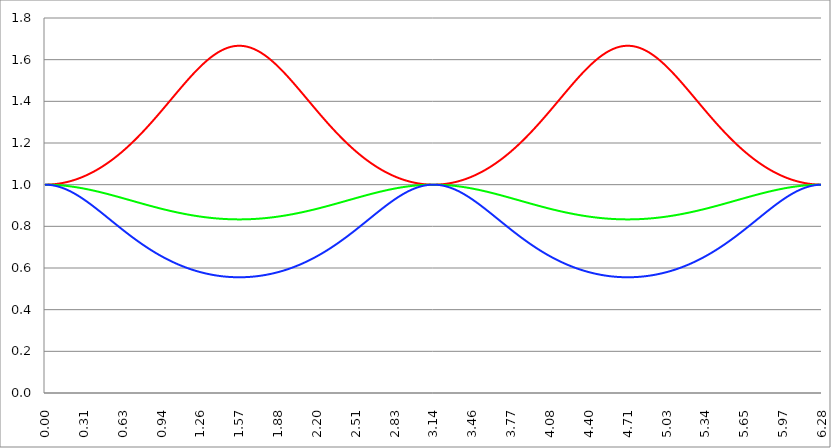
| Category | Series 1 | Series 0 | Series 2 |
|---|---|---|---|
| 0.0 | 1 | 1 | 1 |
| 0.00314159265358979 | 1 | 1 | 1 |
| 0.00628318530717958 | 1 | 1 | 1 |
| 0.00942477796076938 | 1 | 1 | 1 |
| 0.0125663706143592 | 1 | 1 | 1 |
| 0.015707963267949 | 1 | 1 | 1 |
| 0.0188495559215388 | 1 | 1 | 1 |
| 0.0219911485751285 | 1 | 1 | 1 |
| 0.0251327412287183 | 1 | 1 | 0.999 |
| 0.0282743338823081 | 1 | 1 | 0.999 |
| 0.0314159265358979 | 1 | 1 | 0.999 |
| 0.0345575191894877 | 1 | 1 | 0.999 |
| 0.0376991118430775 | 1.001 | 1 | 0.999 |
| 0.0408407044966673 | 1.001 | 1 | 0.999 |
| 0.0439822971502571 | 1.001 | 1 | 0.998 |
| 0.0471238898038469 | 1.001 | 1 | 0.998 |
| 0.0502654824574367 | 1.001 | 0.999 | 0.998 |
| 0.0534070751110265 | 1.001 | 0.999 | 0.998 |
| 0.0565486677646163 | 1.001 | 0.999 | 0.997 |
| 0.059690260418206 | 1.001 | 0.999 | 0.997 |
| 0.0628318530717958 | 1.002 | 0.999 | 0.997 |
| 0.0659734457253856 | 1.002 | 0.999 | 0.997 |
| 0.0691150383789754 | 1.002 | 0.999 | 0.996 |
| 0.0722566310325652 | 1.002 | 0.999 | 0.996 |
| 0.075398223686155 | 1.002 | 0.999 | 0.995 |
| 0.0785398163397448 | 1.002 | 0.999 | 0.995 |
| 0.0816814089933346 | 1.003 | 0.999 | 0.995 |
| 0.0848230016469244 | 1.003 | 0.999 | 0.994 |
| 0.0879645943005142 | 1.003 | 0.998 | 0.994 |
| 0.091106186954104 | 1.003 | 0.998 | 0.993 |
| 0.0942477796076937 | 1.004 | 0.998 | 0.993 |
| 0.0973893722612835 | 1.004 | 0.998 | 0.992 |
| 0.100530964914873 | 1.004 | 0.998 | 0.992 |
| 0.103672557568463 | 1.004 | 0.998 | 0.992 |
| 0.106814150222053 | 1.005 | 0.998 | 0.991 |
| 0.109955742875643 | 1.005 | 0.998 | 0.99 |
| 0.113097335529233 | 1.005 | 0.997 | 0.99 |
| 0.116238928182822 | 1.005 | 0.997 | 0.989 |
| 0.119380520836412 | 1.006 | 0.997 | 0.989 |
| 0.122522113490002 | 1.006 | 0.997 | 0.988 |
| 0.125663706143592 | 1.006 | 0.997 | 0.988 |
| 0.128805298797181 | 1.007 | 0.997 | 0.987 |
| 0.131946891450771 | 1.007 | 0.997 | 0.986 |
| 0.135088484104361 | 1.007 | 0.996 | 0.986 |
| 0.138230076757951 | 1.008 | 0.996 | 0.985 |
| 0.141371669411541 | 1.008 | 0.996 | 0.984 |
| 0.14451326206513 | 1.008 | 0.996 | 0.984 |
| 0.14765485471872 | 1.009 | 0.996 | 0.983 |
| 0.15079644737231 | 1.009 | 0.996 | 0.982 |
| 0.1539380400259 | 1.009 | 0.995 | 0.982 |
| 0.15707963267949 | 1.01 | 0.995 | 0.981 |
| 0.160221225333079 | 1.01 | 0.995 | 0.98 |
| 0.163362817986669 | 1.011 | 0.995 | 0.979 |
| 0.166504410640259 | 1.011 | 0.995 | 0.978 |
| 0.169646003293849 | 1.012 | 0.994 | 0.978 |
| 0.172787595947439 | 1.012 | 0.994 | 0.977 |
| 0.175929188601028 | 1.012 | 0.994 | 0.976 |
| 0.179070781254618 | 1.013 | 0.994 | 0.975 |
| 0.182212373908208 | 1.013 | 0.993 | 0.974 |
| 0.185353966561798 | 1.014 | 0.993 | 0.974 |
| 0.188495559215388 | 1.014 | 0.993 | 0.973 |
| 0.191637151868977 | 1.015 | 0.993 | 0.972 |
| 0.194778744522567 | 1.015 | 0.993 | 0.971 |
| 0.197920337176157 | 1.016 | 0.992 | 0.97 |
| 0.201061929829747 | 1.016 | 0.992 | 0.969 |
| 0.204203522483336 | 1.017 | 0.992 | 0.968 |
| 0.207345115136926 | 1.017 | 0.992 | 0.967 |
| 0.210486707790516 | 1.018 | 0.991 | 0.966 |
| 0.213628300444106 | 1.018 | 0.991 | 0.965 |
| 0.216769893097696 | 1.019 | 0.991 | 0.964 |
| 0.219911485751285 | 1.019 | 0.991 | 0.963 |
| 0.223053078404875 | 1.02 | 0.99 | 0.962 |
| 0.226194671058465 | 1.021 | 0.99 | 0.961 |
| 0.229336263712055 | 1.021 | 0.99 | 0.96 |
| 0.232477856365645 | 1.022 | 0.989 | 0.959 |
| 0.235619449019234 | 1.022 | 0.989 | 0.958 |
| 0.238761041672824 | 1.023 | 0.989 | 0.957 |
| 0.241902634326414 | 1.023 | 0.989 | 0.956 |
| 0.245044226980004 | 1.024 | 0.988 | 0.955 |
| 0.248185819633594 | 1.025 | 0.988 | 0.954 |
| 0.251327412287183 | 1.025 | 0.988 | 0.953 |
| 0.254469004940773 | 1.026 | 0.987 | 0.952 |
| 0.257610597594363 | 1.027 | 0.987 | 0.951 |
| 0.260752190247953 | 1.027 | 0.987 | 0.95 |
| 0.263893782901543 | 1.028 | 0.987 | 0.948 |
| 0.267035375555132 | 1.029 | 0.986 | 0.947 |
| 0.270176968208722 | 1.029 | 0.986 | 0.946 |
| 0.273318560862312 | 1.03 | 0.986 | 0.945 |
| 0.276460153515902 | 1.031 | 0.985 | 0.944 |
| 0.279601746169492 | 1.031 | 0.985 | 0.943 |
| 0.282743338823082 | 1.032 | 0.985 | 0.941 |
| 0.285884931476671 | 1.033 | 0.984 | 0.94 |
| 0.289026524130261 | 1.034 | 0.984 | 0.939 |
| 0.292168116783851 | 1.034 | 0.984 | 0.938 |
| 0.295309709437441 | 1.035 | 0.983 | 0.937 |
| 0.298451302091031 | 1.036 | 0.983 | 0.935 |
| 0.30159289474462 | 1.037 | 0.983 | 0.934 |
| 0.30473448739821 | 1.037 | 0.982 | 0.933 |
| 0.3078760800518 | 1.038 | 0.982 | 0.932 |
| 0.31101767270539 | 1.039 | 0.982 | 0.93 |
| 0.31415926535898 | 1.04 | 0.981 | 0.929 |
| 0.31730085801257 | 1.041 | 0.981 | 0.928 |
| 0.320442450666159 | 1.041 | 0.981 | 0.926 |
| 0.323584043319749 | 1.042 | 0.98 | 0.925 |
| 0.326725635973339 | 1.043 | 0.98 | 0.924 |
| 0.329867228626929 | 1.044 | 0.979 | 0.923 |
| 0.333008821280519 | 1.045 | 0.979 | 0.921 |
| 0.336150413934108 | 1.046 | 0.979 | 0.92 |
| 0.339292006587698 | 1.046 | 0.978 | 0.919 |
| 0.342433599241288 | 1.047 | 0.978 | 0.917 |
| 0.345575191894878 | 1.048 | 0.978 | 0.916 |
| 0.348716784548468 | 1.049 | 0.977 | 0.915 |
| 0.351858377202058 | 1.05 | 0.977 | 0.913 |
| 0.354999969855647 | 1.051 | 0.976 | 0.912 |
| 0.358141562509237 | 1.052 | 0.976 | 0.91 |
| 0.361283155162827 | 1.053 | 0.976 | 0.909 |
| 0.364424747816417 | 1.054 | 0.975 | 0.908 |
| 0.367566340470007 | 1.054 | 0.975 | 0.906 |
| 0.370707933123597 | 1.055 | 0.974 | 0.905 |
| 0.373849525777186 | 1.056 | 0.974 | 0.904 |
| 0.376991118430776 | 1.057 | 0.974 | 0.902 |
| 0.380132711084366 | 1.058 | 0.973 | 0.901 |
| 0.383274303737956 | 1.059 | 0.973 | 0.899 |
| 0.386415896391546 | 1.06 | 0.972 | 0.898 |
| 0.389557489045135 | 1.061 | 0.972 | 0.897 |
| 0.392699081698725 | 1.062 | 0.972 | 0.895 |
| 0.395840674352315 | 1.063 | 0.971 | 0.894 |
| 0.398982267005905 | 1.064 | 0.971 | 0.892 |
| 0.402123859659495 | 1.065 | 0.97 | 0.891 |
| 0.405265452313085 | 1.066 | 0.97 | 0.889 |
| 0.408407044966674 | 1.067 | 0.969 | 0.888 |
| 0.411548637620264 | 1.068 | 0.969 | 0.887 |
| 0.414690230273854 | 1.069 | 0.969 | 0.885 |
| 0.417831822927444 | 1.071 | 0.968 | 0.884 |
| 0.420973415581034 | 1.072 | 0.968 | 0.882 |
| 0.424115008234623 | 1.073 | 0.967 | 0.881 |
| 0.427256600888213 | 1.074 | 0.967 | 0.879 |
| 0.430398193541803 | 1.075 | 0.966 | 0.878 |
| 0.433539786195393 | 1.076 | 0.966 | 0.876 |
| 0.436681378848983 | 1.077 | 0.965 | 0.875 |
| 0.439822971502573 | 1.078 | 0.965 | 0.873 |
| 0.442964564156162 | 1.079 | 0.965 | 0.872 |
| 0.446106156809752 | 1.08 | 0.964 | 0.87 |
| 0.449247749463342 | 1.082 | 0.964 | 0.869 |
| 0.452389342116932 | 1.083 | 0.963 | 0.867 |
| 0.455530934770522 | 1.084 | 0.963 | 0.866 |
| 0.458672527424111 | 1.085 | 0.962 | 0.864 |
| 0.461814120077701 | 1.086 | 0.962 | 0.863 |
| 0.464955712731291 | 1.087 | 0.961 | 0.861 |
| 0.468097305384881 | 1.089 | 0.961 | 0.86 |
| 0.471238898038471 | 1.09 | 0.96 | 0.858 |
| 0.474380490692061 | 1.091 | 0.96 | 0.857 |
| 0.47752208334565 | 1.092 | 0.959 | 0.855 |
| 0.48066367599924 | 1.094 | 0.959 | 0.854 |
| 0.48380526865283 | 1.095 | 0.959 | 0.852 |
| 0.48694686130642 | 1.096 | 0.958 | 0.851 |
| 0.49008845396001 | 1.097 | 0.958 | 0.849 |
| 0.493230046613599 | 1.099 | 0.957 | 0.848 |
| 0.496371639267189 | 1.1 | 0.957 | 0.846 |
| 0.499513231920779 | 1.101 | 0.956 | 0.845 |
| 0.502654824574369 | 1.102 | 0.956 | 0.843 |
| 0.505796417227959 | 1.104 | 0.955 | 0.842 |
| 0.508938009881549 | 1.105 | 0.955 | 0.84 |
| 0.512079602535138 | 1.106 | 0.954 | 0.839 |
| 0.515221195188728 | 1.108 | 0.954 | 0.837 |
| 0.518362787842318 | 1.109 | 0.953 | 0.836 |
| 0.521504380495908 | 1.11 | 0.953 | 0.834 |
| 0.524645973149498 | 1.112 | 0.952 | 0.833 |
| 0.527787565803087 | 1.113 | 0.952 | 0.831 |
| 0.530929158456677 | 1.114 | 0.951 | 0.83 |
| 0.534070751110267 | 1.116 | 0.951 | 0.828 |
| 0.537212343763857 | 1.117 | 0.95 | 0.827 |
| 0.540353936417447 | 1.118 | 0.95 | 0.825 |
| 0.543495529071037 | 1.12 | 0.949 | 0.824 |
| 0.546637121724626 | 1.121 | 0.949 | 0.822 |
| 0.549778714378216 | 1.123 | 0.948 | 0.821 |
| 0.552920307031806 | 1.124 | 0.948 | 0.819 |
| 0.556061899685396 | 1.125 | 0.947 | 0.818 |
| 0.559203492338986 | 1.127 | 0.947 | 0.816 |
| 0.562345084992576 | 1.128 | 0.946 | 0.815 |
| 0.565486677646165 | 1.13 | 0.946 | 0.813 |
| 0.568628270299755 | 1.131 | 0.945 | 0.812 |
| 0.571769862953345 | 1.133 | 0.945 | 0.81 |
| 0.574911455606935 | 1.134 | 0.944 | 0.809 |
| 0.578053048260525 | 1.136 | 0.944 | 0.807 |
| 0.581194640914114 | 1.137 | 0.943 | 0.806 |
| 0.584336233567704 | 1.139 | 0.943 | 0.804 |
| 0.587477826221294 | 1.14 | 0.942 | 0.803 |
| 0.590619418874884 | 1.142 | 0.942 | 0.801 |
| 0.593761011528474 | 1.143 | 0.941 | 0.8 |
| 0.596902604182064 | 1.145 | 0.941 | 0.798 |
| 0.600044196835653 | 1.146 | 0.94 | 0.797 |
| 0.603185789489243 | 1.148 | 0.94 | 0.795 |
| 0.606327382142833 | 1.149 | 0.939 | 0.794 |
| 0.609468974796423 | 1.151 | 0.938 | 0.792 |
| 0.612610567450013 | 1.152 | 0.938 | 0.791 |
| 0.615752160103602 | 1.154 | 0.937 | 0.789 |
| 0.618893752757192 | 1.156 | 0.937 | 0.788 |
| 0.622035345410782 | 1.157 | 0.936 | 0.786 |
| 0.625176938064372 | 1.159 | 0.936 | 0.785 |
| 0.628318530717962 | 1.16 | 0.935 | 0.783 |
| 0.631460123371551 | 1.162 | 0.935 | 0.782 |
| 0.634601716025141 | 1.164 | 0.934 | 0.781 |
| 0.637743308678731 | 1.165 | 0.934 | 0.779 |
| 0.640884901332321 | 1.167 | 0.933 | 0.778 |
| 0.644026493985911 | 1.168 | 0.933 | 0.776 |
| 0.647168086639501 | 1.17 | 0.932 | 0.775 |
| 0.65030967929309 | 1.172 | 0.932 | 0.773 |
| 0.65345127194668 | 1.173 | 0.931 | 0.772 |
| 0.65659286460027 | 1.175 | 0.931 | 0.77 |
| 0.65973445725386 | 1.177 | 0.93 | 0.769 |
| 0.66287604990745 | 1.179 | 0.93 | 0.767 |
| 0.666017642561039 | 1.18 | 0.929 | 0.766 |
| 0.669159235214629 | 1.182 | 0.929 | 0.765 |
| 0.672300827868219 | 1.184 | 0.928 | 0.763 |
| 0.675442420521809 | 1.185 | 0.927 | 0.762 |
| 0.678584013175399 | 1.187 | 0.927 | 0.76 |
| 0.681725605828989 | 1.189 | 0.926 | 0.759 |
| 0.684867198482578 | 1.191 | 0.926 | 0.758 |
| 0.688008791136168 | 1.192 | 0.925 | 0.756 |
| 0.691150383789758 | 1.194 | 0.925 | 0.755 |
| 0.694291976443348 | 1.196 | 0.924 | 0.753 |
| 0.697433569096938 | 1.198 | 0.924 | 0.752 |
| 0.700575161750528 | 1.199 | 0.923 | 0.75 |
| 0.703716754404117 | 1.201 | 0.923 | 0.749 |
| 0.706858347057707 | 1.203 | 0.922 | 0.748 |
| 0.709999939711297 | 1.205 | 0.922 | 0.746 |
| 0.713141532364887 | 1.207 | 0.921 | 0.745 |
| 0.716283125018477 | 1.208 | 0.921 | 0.744 |
| 0.719424717672066 | 1.21 | 0.92 | 0.742 |
| 0.722566310325656 | 1.212 | 0.92 | 0.741 |
| 0.725707902979246 | 1.214 | 0.919 | 0.739 |
| 0.728849495632836 | 1.216 | 0.919 | 0.738 |
| 0.731991088286426 | 1.218 | 0.918 | 0.737 |
| 0.735132680940016 | 1.219 | 0.917 | 0.735 |
| 0.738274273593605 | 1.221 | 0.917 | 0.734 |
| 0.741415866247195 | 1.223 | 0.916 | 0.733 |
| 0.744557458900785 | 1.225 | 0.916 | 0.731 |
| 0.747699051554375 | 1.227 | 0.915 | 0.73 |
| 0.750840644207965 | 1.229 | 0.915 | 0.729 |
| 0.753982236861554 | 1.231 | 0.914 | 0.727 |
| 0.757123829515144 | 1.233 | 0.914 | 0.726 |
| 0.760265422168734 | 1.234 | 0.913 | 0.725 |
| 0.763407014822324 | 1.236 | 0.913 | 0.723 |
| 0.766548607475914 | 1.238 | 0.912 | 0.722 |
| 0.769690200129504 | 1.24 | 0.912 | 0.721 |
| 0.772831792783093 | 1.242 | 0.911 | 0.719 |
| 0.775973385436683 | 1.244 | 0.911 | 0.718 |
| 0.779114978090273 | 1.246 | 0.91 | 0.717 |
| 0.782256570743863 | 1.248 | 0.91 | 0.716 |
| 0.785398163397453 | 1.25 | 0.909 | 0.714 |
| 0.788539756051042 | 1.252 | 0.909 | 0.713 |
| 0.791681348704632 | 1.254 | 0.908 | 0.712 |
| 0.794822941358222 | 1.256 | 0.908 | 0.71 |
| 0.797964534011812 | 1.258 | 0.907 | 0.709 |
| 0.801106126665402 | 1.26 | 0.907 | 0.708 |
| 0.804247719318992 | 1.262 | 0.906 | 0.707 |
| 0.807389311972581 | 1.264 | 0.905 | 0.705 |
| 0.810530904626171 | 1.266 | 0.905 | 0.704 |
| 0.813672497279761 | 1.268 | 0.904 | 0.703 |
| 0.816814089933351 | 1.27 | 0.904 | 0.702 |
| 0.819955682586941 | 1.272 | 0.903 | 0.7 |
| 0.823097275240531 | 1.274 | 0.903 | 0.699 |
| 0.82623886789412 | 1.276 | 0.902 | 0.698 |
| 0.82938046054771 | 1.278 | 0.902 | 0.697 |
| 0.8325220532013 | 1.28 | 0.901 | 0.696 |
| 0.83566364585489 | 1.282 | 0.901 | 0.694 |
| 0.83880523850848 | 1.284 | 0.9 | 0.693 |
| 0.841946831162069 | 1.286 | 0.9 | 0.692 |
| 0.845088423815659 | 1.288 | 0.899 | 0.691 |
| 0.848230016469249 | 1.29 | 0.899 | 0.69 |
| 0.851371609122839 | 1.293 | 0.898 | 0.688 |
| 0.854513201776429 | 1.295 | 0.898 | 0.687 |
| 0.857654794430019 | 1.297 | 0.897 | 0.686 |
| 0.860796387083608 | 1.299 | 0.897 | 0.685 |
| 0.863937979737198 | 1.301 | 0.896 | 0.684 |
| 0.867079572390788 | 1.303 | 0.896 | 0.683 |
| 0.870221165044378 | 1.305 | 0.895 | 0.681 |
| 0.873362757697968 | 1.307 | 0.895 | 0.68 |
| 0.876504350351557 | 1.309 | 0.894 | 0.679 |
| 0.879645943005147 | 1.311 | 0.894 | 0.678 |
| 0.882787535658737 | 1.314 | 0.893 | 0.677 |
| 0.885929128312327 | 1.316 | 0.893 | 0.676 |
| 0.889070720965917 | 1.318 | 0.892 | 0.675 |
| 0.892212313619507 | 1.32 | 0.892 | 0.673 |
| 0.895353906273096 | 1.322 | 0.891 | 0.672 |
| 0.898495498926686 | 1.324 | 0.891 | 0.671 |
| 0.901637091580276 | 1.326 | 0.89 | 0.67 |
| 0.904778684233866 | 1.329 | 0.89 | 0.669 |
| 0.907920276887456 | 1.331 | 0.889 | 0.668 |
| 0.911061869541045 | 1.333 | 0.889 | 0.667 |
| 0.914203462194635 | 1.335 | 0.889 | 0.666 |
| 0.917345054848225 | 1.337 | 0.888 | 0.665 |
| 0.920486647501815 | 1.339 | 0.888 | 0.664 |
| 0.923628240155405 | 1.342 | 0.887 | 0.663 |
| 0.926769832808995 | 1.344 | 0.887 | 0.662 |
| 0.929911425462584 | 1.346 | 0.886 | 0.66 |
| 0.933053018116174 | 1.348 | 0.886 | 0.659 |
| 0.936194610769764 | 1.35 | 0.885 | 0.658 |
| 0.939336203423354 | 1.352 | 0.885 | 0.657 |
| 0.942477796076944 | 1.355 | 0.884 | 0.656 |
| 0.945619388730533 | 1.357 | 0.884 | 0.655 |
| 0.948760981384123 | 1.359 | 0.883 | 0.654 |
| 0.951902574037713 | 1.361 | 0.883 | 0.653 |
| 0.955044166691303 | 1.363 | 0.882 | 0.652 |
| 0.958185759344893 | 1.366 | 0.882 | 0.651 |
| 0.961327351998483 | 1.368 | 0.881 | 0.65 |
| 0.964468944652072 | 1.37 | 0.881 | 0.649 |
| 0.967610537305662 | 1.372 | 0.881 | 0.648 |
| 0.970752129959252 | 1.374 | 0.88 | 0.647 |
| 0.973893722612842 | 1.377 | 0.88 | 0.646 |
| 0.977035315266432 | 1.379 | 0.879 | 0.645 |
| 0.980176907920022 | 1.381 | 0.879 | 0.644 |
| 0.983318500573611 | 1.383 | 0.878 | 0.643 |
| 0.986460093227201 | 1.386 | 0.878 | 0.642 |
| 0.989601685880791 | 1.388 | 0.877 | 0.641 |
| 0.992743278534381 | 1.39 | 0.877 | 0.641 |
| 0.995884871187971 | 1.392 | 0.877 | 0.64 |
| 0.99902646384156 | 1.394 | 0.876 | 0.639 |
| 1.00216805649515 | 1.397 | 0.876 | 0.638 |
| 1.00530964914874 | 1.399 | 0.875 | 0.637 |
| 1.00845124180233 | 1.401 | 0.875 | 0.636 |
| 1.01159283445592 | 1.403 | 0.874 | 0.635 |
| 1.01473442710951 | 1.406 | 0.874 | 0.634 |
| 1.017876019763099 | 1.408 | 0.873 | 0.633 |
| 1.021017612416689 | 1.41 | 0.873 | 0.632 |
| 1.02415920507028 | 1.412 | 0.873 | 0.631 |
| 1.027300797723869 | 1.414 | 0.872 | 0.63 |
| 1.030442390377459 | 1.417 | 0.872 | 0.63 |
| 1.033583983031048 | 1.419 | 0.871 | 0.629 |
| 1.036725575684638 | 1.421 | 0.871 | 0.628 |
| 1.039867168338228 | 1.423 | 0.871 | 0.627 |
| 1.043008760991818 | 1.426 | 0.87 | 0.626 |
| 1.046150353645408 | 1.428 | 0.87 | 0.625 |
| 1.049291946298998 | 1.43 | 0.869 | 0.624 |
| 1.052433538952587 | 1.432 | 0.869 | 0.624 |
| 1.055575131606177 | 1.434 | 0.868 | 0.623 |
| 1.058716724259767 | 1.437 | 0.868 | 0.622 |
| 1.061858316913357 | 1.439 | 0.868 | 0.621 |
| 1.064999909566947 | 1.441 | 0.867 | 0.62 |
| 1.068141502220536 | 1.443 | 0.867 | 0.619 |
| 1.071283094874126 | 1.446 | 0.866 | 0.619 |
| 1.074424687527716 | 1.448 | 0.866 | 0.618 |
| 1.077566280181306 | 1.45 | 0.866 | 0.617 |
| 1.080707872834896 | 1.452 | 0.865 | 0.616 |
| 1.083849465488486 | 1.454 | 0.865 | 0.615 |
| 1.086991058142075 | 1.457 | 0.865 | 0.615 |
| 1.090132650795665 | 1.459 | 0.864 | 0.614 |
| 1.093274243449255 | 1.461 | 0.864 | 0.613 |
| 1.096415836102845 | 1.463 | 0.863 | 0.612 |
| 1.099557428756435 | 1.465 | 0.863 | 0.612 |
| 1.102699021410025 | 1.468 | 0.863 | 0.611 |
| 1.105840614063614 | 1.47 | 0.862 | 0.61 |
| 1.108982206717204 | 1.472 | 0.862 | 0.609 |
| 1.112123799370794 | 1.474 | 0.861 | 0.609 |
| 1.115265392024384 | 1.476 | 0.861 | 0.608 |
| 1.118406984677974 | 1.478 | 0.861 | 0.607 |
| 1.121548577331563 | 1.481 | 0.86 | 0.606 |
| 1.124690169985153 | 1.483 | 0.86 | 0.606 |
| 1.127831762638743 | 1.485 | 0.86 | 0.605 |
| 1.130973355292333 | 1.487 | 0.859 | 0.604 |
| 1.134114947945923 | 1.489 | 0.859 | 0.604 |
| 1.137256540599513 | 1.491 | 0.859 | 0.603 |
| 1.140398133253102 | 1.493 | 0.858 | 0.602 |
| 1.143539725906692 | 1.495 | 0.858 | 0.601 |
| 1.146681318560282 | 1.498 | 0.858 | 0.601 |
| 1.149822911213872 | 1.5 | 0.857 | 0.6 |
| 1.152964503867462 | 1.502 | 0.857 | 0.599 |
| 1.156106096521051 | 1.504 | 0.857 | 0.599 |
| 1.159247689174641 | 1.506 | 0.856 | 0.598 |
| 1.162389281828231 | 1.508 | 0.856 | 0.597 |
| 1.165530874481821 | 1.51 | 0.855 | 0.597 |
| 1.168672467135411 | 1.512 | 0.855 | 0.596 |
| 1.171814059789001 | 1.514 | 0.855 | 0.595 |
| 1.17495565244259 | 1.516 | 0.855 | 0.595 |
| 1.17809724509618 | 1.518 | 0.854 | 0.594 |
| 1.18123883774977 | 1.52 | 0.854 | 0.594 |
| 1.18438043040336 | 1.523 | 0.854 | 0.593 |
| 1.18752202305695 | 1.525 | 0.853 | 0.592 |
| 1.190663615710539 | 1.527 | 0.853 | 0.592 |
| 1.193805208364129 | 1.529 | 0.853 | 0.591 |
| 1.19694680101772 | 1.531 | 0.852 | 0.591 |
| 1.200088393671309 | 1.533 | 0.852 | 0.59 |
| 1.203229986324899 | 1.535 | 0.852 | 0.589 |
| 1.206371578978489 | 1.537 | 0.851 | 0.589 |
| 1.209513171632078 | 1.539 | 0.851 | 0.588 |
| 1.212654764285668 | 1.54 | 0.851 | 0.588 |
| 1.215796356939258 | 1.542 | 0.85 | 0.587 |
| 1.218937949592848 | 1.544 | 0.85 | 0.587 |
| 1.222079542246438 | 1.546 | 0.85 | 0.586 |
| 1.225221134900027 | 1.548 | 0.85 | 0.585 |
| 1.228362727553617 | 1.55 | 0.849 | 0.585 |
| 1.231504320207207 | 1.552 | 0.849 | 0.584 |
| 1.234645912860797 | 1.554 | 0.849 | 0.584 |
| 1.237787505514387 | 1.556 | 0.848 | 0.583 |
| 1.240929098167977 | 1.558 | 0.848 | 0.583 |
| 1.244070690821566 | 1.56 | 0.848 | 0.582 |
| 1.247212283475156 | 1.561 | 0.848 | 0.582 |
| 1.250353876128746 | 1.563 | 0.847 | 0.581 |
| 1.253495468782336 | 1.565 | 0.847 | 0.581 |
| 1.256637061435926 | 1.567 | 0.847 | 0.58 |
| 1.259778654089515 | 1.569 | 0.847 | 0.58 |
| 1.262920246743105 | 1.571 | 0.846 | 0.579 |
| 1.266061839396695 | 1.572 | 0.846 | 0.579 |
| 1.269203432050285 | 1.574 | 0.846 | 0.578 |
| 1.272345024703875 | 1.576 | 0.846 | 0.578 |
| 1.275486617357465 | 1.578 | 0.845 | 0.577 |
| 1.278628210011054 | 1.579 | 0.845 | 0.577 |
| 1.281769802664644 | 1.581 | 0.845 | 0.576 |
| 1.284911395318234 | 1.583 | 0.845 | 0.576 |
| 1.288052987971824 | 1.584 | 0.844 | 0.575 |
| 1.291194580625414 | 1.586 | 0.844 | 0.575 |
| 1.294336173279003 | 1.588 | 0.844 | 0.575 |
| 1.297477765932593 | 1.589 | 0.844 | 0.574 |
| 1.300619358586183 | 1.591 | 0.843 | 0.574 |
| 1.303760951239773 | 1.593 | 0.843 | 0.573 |
| 1.306902543893363 | 1.594 | 0.843 | 0.573 |
| 1.310044136546953 | 1.596 | 0.843 | 0.572 |
| 1.313185729200542 | 1.598 | 0.842 | 0.572 |
| 1.316327321854132 | 1.599 | 0.842 | 0.572 |
| 1.319468914507722 | 1.601 | 0.842 | 0.571 |
| 1.322610507161312 | 1.602 | 0.842 | 0.571 |
| 1.325752099814902 | 1.604 | 0.842 | 0.57 |
| 1.328893692468491 | 1.605 | 0.841 | 0.57 |
| 1.332035285122081 | 1.607 | 0.841 | 0.57 |
| 1.335176877775671 | 1.608 | 0.841 | 0.569 |
| 1.338318470429261 | 1.61 | 0.841 | 0.569 |
| 1.341460063082851 | 1.611 | 0.841 | 0.569 |
| 1.344601655736441 | 1.613 | 0.84 | 0.568 |
| 1.34774324839003 | 1.614 | 0.84 | 0.568 |
| 1.35088484104362 | 1.615 | 0.84 | 0.568 |
| 1.35402643369721 | 1.617 | 0.84 | 0.567 |
| 1.3571680263508 | 1.618 | 0.84 | 0.567 |
| 1.36030961900439 | 1.62 | 0.839 | 0.567 |
| 1.363451211657979 | 1.621 | 0.839 | 0.566 |
| 1.36659280431157 | 1.622 | 0.839 | 0.566 |
| 1.369734396965159 | 1.623 | 0.839 | 0.566 |
| 1.372875989618749 | 1.625 | 0.839 | 0.565 |
| 1.376017582272339 | 1.626 | 0.839 | 0.565 |
| 1.379159174925929 | 1.627 | 0.838 | 0.565 |
| 1.382300767579518 | 1.629 | 0.838 | 0.564 |
| 1.385442360233108 | 1.63 | 0.838 | 0.564 |
| 1.388583952886698 | 1.631 | 0.838 | 0.564 |
| 1.391725545540288 | 1.632 | 0.838 | 0.564 |
| 1.394867138193878 | 1.633 | 0.838 | 0.563 |
| 1.398008730847468 | 1.634 | 0.837 | 0.563 |
| 1.401150323501057 | 1.636 | 0.837 | 0.563 |
| 1.404291916154647 | 1.637 | 0.837 | 0.562 |
| 1.407433508808237 | 1.638 | 0.837 | 0.562 |
| 1.410575101461827 | 1.639 | 0.837 | 0.562 |
| 1.413716694115417 | 1.64 | 0.837 | 0.562 |
| 1.416858286769006 | 1.641 | 0.837 | 0.561 |
| 1.419999879422596 | 1.642 | 0.836 | 0.561 |
| 1.423141472076186 | 1.643 | 0.836 | 0.561 |
| 1.426283064729776 | 1.644 | 0.836 | 0.561 |
| 1.429424657383366 | 1.645 | 0.836 | 0.561 |
| 1.432566250036956 | 1.646 | 0.836 | 0.56 |
| 1.435707842690545 | 1.647 | 0.836 | 0.56 |
| 1.438849435344135 | 1.648 | 0.836 | 0.56 |
| 1.441991027997725 | 1.649 | 0.836 | 0.56 |
| 1.445132620651315 | 1.649 | 0.836 | 0.559 |
| 1.448274213304905 | 1.65 | 0.835 | 0.559 |
| 1.451415805958494 | 1.651 | 0.835 | 0.559 |
| 1.454557398612084 | 1.652 | 0.835 | 0.559 |
| 1.457698991265674 | 1.653 | 0.835 | 0.559 |
| 1.460840583919264 | 1.653 | 0.835 | 0.559 |
| 1.463982176572854 | 1.654 | 0.835 | 0.558 |
| 1.467123769226444 | 1.655 | 0.835 | 0.558 |
| 1.470265361880033 | 1.656 | 0.835 | 0.558 |
| 1.473406954533623 | 1.656 | 0.835 | 0.558 |
| 1.476548547187213 | 1.657 | 0.835 | 0.558 |
| 1.479690139840803 | 1.658 | 0.834 | 0.558 |
| 1.482831732494393 | 1.658 | 0.834 | 0.557 |
| 1.485973325147982 | 1.659 | 0.834 | 0.557 |
| 1.489114917801572 | 1.659 | 0.834 | 0.557 |
| 1.492256510455162 | 1.66 | 0.834 | 0.557 |
| 1.495398103108752 | 1.66 | 0.834 | 0.557 |
| 1.498539695762342 | 1.661 | 0.834 | 0.557 |
| 1.501681288415932 | 1.661 | 0.834 | 0.557 |
| 1.504822881069521 | 1.662 | 0.834 | 0.557 |
| 1.507964473723111 | 1.662 | 0.834 | 0.557 |
| 1.511106066376701 | 1.663 | 0.834 | 0.556 |
| 1.514247659030291 | 1.663 | 0.834 | 0.556 |
| 1.517389251683881 | 1.664 | 0.834 | 0.556 |
| 1.520530844337471 | 1.664 | 0.834 | 0.556 |
| 1.52367243699106 | 1.664 | 0.834 | 0.556 |
| 1.52681402964465 | 1.665 | 0.834 | 0.556 |
| 1.52995562229824 | 1.665 | 0.834 | 0.556 |
| 1.53309721495183 | 1.665 | 0.834 | 0.556 |
| 1.53623880760542 | 1.665 | 0.833 | 0.556 |
| 1.539380400259009 | 1.666 | 0.833 | 0.556 |
| 1.542521992912599 | 1.666 | 0.833 | 0.556 |
| 1.545663585566189 | 1.666 | 0.833 | 0.556 |
| 1.548805178219779 | 1.666 | 0.833 | 0.556 |
| 1.551946770873369 | 1.666 | 0.833 | 0.556 |
| 1.555088363526959 | 1.666 | 0.833 | 0.556 |
| 1.558229956180548 | 1.666 | 0.833 | 0.556 |
| 1.561371548834138 | 1.667 | 0.833 | 0.556 |
| 1.564513141487728 | 1.667 | 0.833 | 0.556 |
| 1.567654734141318 | 1.667 | 0.833 | 0.556 |
| 1.570796326794908 | 1.667 | 0.833 | 0.556 |
| 1.573937919448497 | 1.667 | 0.833 | 0.556 |
| 1.577079512102087 | 1.667 | 0.833 | 0.556 |
| 1.580221104755677 | 1.667 | 0.833 | 0.556 |
| 1.583362697409267 | 1.666 | 0.833 | 0.556 |
| 1.586504290062857 | 1.666 | 0.833 | 0.556 |
| 1.589645882716447 | 1.666 | 0.833 | 0.556 |
| 1.592787475370036 | 1.666 | 0.833 | 0.556 |
| 1.595929068023626 | 1.666 | 0.833 | 0.556 |
| 1.599070660677216 | 1.666 | 0.833 | 0.556 |
| 1.602212253330806 | 1.666 | 0.833 | 0.556 |
| 1.605353845984396 | 1.665 | 0.833 | 0.556 |
| 1.608495438637985 | 1.665 | 0.834 | 0.556 |
| 1.611637031291575 | 1.665 | 0.834 | 0.556 |
| 1.614778623945165 | 1.665 | 0.834 | 0.556 |
| 1.617920216598755 | 1.664 | 0.834 | 0.556 |
| 1.621061809252345 | 1.664 | 0.834 | 0.556 |
| 1.624203401905935 | 1.664 | 0.834 | 0.556 |
| 1.627344994559524 | 1.663 | 0.834 | 0.556 |
| 1.630486587213114 | 1.663 | 0.834 | 0.556 |
| 1.633628179866704 | 1.662 | 0.834 | 0.557 |
| 1.636769772520294 | 1.662 | 0.834 | 0.557 |
| 1.639911365173884 | 1.661 | 0.834 | 0.557 |
| 1.643052957827473 | 1.661 | 0.834 | 0.557 |
| 1.646194550481063 | 1.66 | 0.834 | 0.557 |
| 1.649336143134653 | 1.66 | 0.834 | 0.557 |
| 1.652477735788243 | 1.659 | 0.834 | 0.557 |
| 1.655619328441833 | 1.659 | 0.834 | 0.557 |
| 1.658760921095423 | 1.658 | 0.834 | 0.557 |
| 1.661902513749012 | 1.658 | 0.834 | 0.558 |
| 1.665044106402602 | 1.657 | 0.835 | 0.558 |
| 1.668185699056192 | 1.656 | 0.835 | 0.558 |
| 1.671327291709782 | 1.656 | 0.835 | 0.558 |
| 1.674468884363372 | 1.655 | 0.835 | 0.558 |
| 1.677610477016961 | 1.654 | 0.835 | 0.558 |
| 1.680752069670551 | 1.653 | 0.835 | 0.559 |
| 1.683893662324141 | 1.653 | 0.835 | 0.559 |
| 1.687035254977731 | 1.652 | 0.835 | 0.559 |
| 1.690176847631321 | 1.651 | 0.835 | 0.559 |
| 1.693318440284911 | 1.65 | 0.835 | 0.559 |
| 1.6964600329385 | 1.649 | 0.836 | 0.559 |
| 1.69960162559209 | 1.649 | 0.836 | 0.56 |
| 1.70274321824568 | 1.648 | 0.836 | 0.56 |
| 1.70588481089927 | 1.647 | 0.836 | 0.56 |
| 1.70902640355286 | 1.646 | 0.836 | 0.56 |
| 1.712167996206449 | 1.645 | 0.836 | 0.561 |
| 1.715309588860039 | 1.644 | 0.836 | 0.561 |
| 1.71845118151363 | 1.643 | 0.836 | 0.561 |
| 1.721592774167219 | 1.642 | 0.836 | 0.561 |
| 1.724734366820809 | 1.641 | 0.837 | 0.561 |
| 1.727875959474399 | 1.64 | 0.837 | 0.562 |
| 1.731017552127988 | 1.639 | 0.837 | 0.562 |
| 1.734159144781578 | 1.638 | 0.837 | 0.562 |
| 1.737300737435168 | 1.637 | 0.837 | 0.562 |
| 1.740442330088758 | 1.636 | 0.837 | 0.563 |
| 1.743583922742348 | 1.634 | 0.837 | 0.563 |
| 1.746725515395937 | 1.633 | 0.838 | 0.563 |
| 1.749867108049527 | 1.632 | 0.838 | 0.564 |
| 1.753008700703117 | 1.631 | 0.838 | 0.564 |
| 1.756150293356707 | 1.63 | 0.838 | 0.564 |
| 1.759291886010297 | 1.629 | 0.838 | 0.564 |
| 1.762433478663887 | 1.627 | 0.838 | 0.565 |
| 1.765575071317476 | 1.626 | 0.839 | 0.565 |
| 1.768716663971066 | 1.625 | 0.839 | 0.565 |
| 1.771858256624656 | 1.623 | 0.839 | 0.566 |
| 1.774999849278246 | 1.622 | 0.839 | 0.566 |
| 1.778141441931836 | 1.621 | 0.839 | 0.566 |
| 1.781283034585426 | 1.62 | 0.839 | 0.567 |
| 1.784424627239015 | 1.618 | 0.84 | 0.567 |
| 1.787566219892605 | 1.617 | 0.84 | 0.567 |
| 1.790707812546195 | 1.615 | 0.84 | 0.568 |
| 1.793849405199785 | 1.614 | 0.84 | 0.568 |
| 1.796990997853375 | 1.613 | 0.84 | 0.568 |
| 1.800132590506964 | 1.611 | 0.841 | 0.569 |
| 1.803274183160554 | 1.61 | 0.841 | 0.569 |
| 1.806415775814144 | 1.608 | 0.841 | 0.569 |
| 1.809557368467734 | 1.607 | 0.841 | 0.57 |
| 1.812698961121324 | 1.605 | 0.841 | 0.57 |
| 1.815840553774914 | 1.604 | 0.842 | 0.57 |
| 1.818982146428503 | 1.602 | 0.842 | 0.571 |
| 1.822123739082093 | 1.601 | 0.842 | 0.571 |
| 1.825265331735683 | 1.599 | 0.842 | 0.572 |
| 1.828406924389273 | 1.598 | 0.842 | 0.572 |
| 1.831548517042863 | 1.596 | 0.843 | 0.572 |
| 1.834690109696452 | 1.594 | 0.843 | 0.573 |
| 1.837831702350042 | 1.593 | 0.843 | 0.573 |
| 1.840973295003632 | 1.591 | 0.843 | 0.574 |
| 1.844114887657222 | 1.589 | 0.844 | 0.574 |
| 1.847256480310812 | 1.588 | 0.844 | 0.575 |
| 1.850398072964402 | 1.586 | 0.844 | 0.575 |
| 1.853539665617991 | 1.584 | 0.844 | 0.575 |
| 1.856681258271581 | 1.583 | 0.845 | 0.576 |
| 1.859822850925171 | 1.581 | 0.845 | 0.576 |
| 1.862964443578761 | 1.579 | 0.845 | 0.577 |
| 1.866106036232351 | 1.578 | 0.845 | 0.577 |
| 1.86924762888594 | 1.576 | 0.846 | 0.578 |
| 1.87238922153953 | 1.574 | 0.846 | 0.578 |
| 1.87553081419312 | 1.572 | 0.846 | 0.579 |
| 1.87867240684671 | 1.571 | 0.846 | 0.579 |
| 1.8818139995003 | 1.569 | 0.847 | 0.58 |
| 1.88495559215389 | 1.567 | 0.847 | 0.58 |
| 1.888097184807479 | 1.565 | 0.847 | 0.581 |
| 1.891238777461069 | 1.563 | 0.847 | 0.581 |
| 1.89438037011466 | 1.561 | 0.848 | 0.582 |
| 1.897521962768249 | 1.56 | 0.848 | 0.582 |
| 1.900663555421839 | 1.558 | 0.848 | 0.583 |
| 1.903805148075429 | 1.556 | 0.848 | 0.583 |
| 1.906946740729018 | 1.554 | 0.849 | 0.584 |
| 1.910088333382608 | 1.552 | 0.849 | 0.584 |
| 1.913229926036198 | 1.55 | 0.849 | 0.585 |
| 1.916371518689788 | 1.548 | 0.85 | 0.585 |
| 1.919513111343378 | 1.546 | 0.85 | 0.586 |
| 1.922654703996967 | 1.544 | 0.85 | 0.587 |
| 1.925796296650557 | 1.542 | 0.85 | 0.587 |
| 1.928937889304147 | 1.54 | 0.851 | 0.588 |
| 1.932079481957737 | 1.539 | 0.851 | 0.588 |
| 1.935221074611327 | 1.537 | 0.851 | 0.589 |
| 1.938362667264917 | 1.535 | 0.852 | 0.589 |
| 1.941504259918506 | 1.533 | 0.852 | 0.59 |
| 1.944645852572096 | 1.531 | 0.852 | 0.591 |
| 1.947787445225686 | 1.529 | 0.853 | 0.591 |
| 1.950929037879276 | 1.527 | 0.853 | 0.592 |
| 1.954070630532866 | 1.525 | 0.853 | 0.592 |
| 1.957212223186455 | 1.523 | 0.854 | 0.593 |
| 1.960353815840045 | 1.52 | 0.854 | 0.594 |
| 1.963495408493635 | 1.518 | 0.854 | 0.594 |
| 1.966637001147225 | 1.516 | 0.855 | 0.595 |
| 1.969778593800815 | 1.514 | 0.855 | 0.595 |
| 1.972920186454405 | 1.512 | 0.855 | 0.596 |
| 1.976061779107994 | 1.51 | 0.855 | 0.597 |
| 1.979203371761584 | 1.508 | 0.856 | 0.597 |
| 1.982344964415174 | 1.506 | 0.856 | 0.598 |
| 1.985486557068764 | 1.504 | 0.857 | 0.599 |
| 1.988628149722354 | 1.502 | 0.857 | 0.599 |
| 1.991769742375943 | 1.5 | 0.857 | 0.6 |
| 1.994911335029533 | 1.498 | 0.858 | 0.601 |
| 1.998052927683123 | 1.495 | 0.858 | 0.601 |
| 2.001194520336712 | 1.493 | 0.858 | 0.602 |
| 2.004336112990302 | 1.491 | 0.859 | 0.603 |
| 2.007477705643892 | 1.489 | 0.859 | 0.604 |
| 2.010619298297482 | 1.487 | 0.859 | 0.604 |
| 2.013760890951071 | 1.485 | 0.86 | 0.605 |
| 2.016902483604661 | 1.483 | 0.86 | 0.606 |
| 2.02004407625825 | 1.481 | 0.86 | 0.606 |
| 2.02318566891184 | 1.478 | 0.861 | 0.607 |
| 2.02632726156543 | 1.476 | 0.861 | 0.608 |
| 2.029468854219019 | 1.474 | 0.861 | 0.609 |
| 2.032610446872609 | 1.472 | 0.862 | 0.609 |
| 2.035752039526198 | 1.47 | 0.862 | 0.61 |
| 2.038893632179788 | 1.468 | 0.863 | 0.611 |
| 2.042035224833378 | 1.465 | 0.863 | 0.612 |
| 2.045176817486967 | 1.463 | 0.863 | 0.612 |
| 2.048318410140557 | 1.461 | 0.864 | 0.613 |
| 2.051460002794146 | 1.459 | 0.864 | 0.614 |
| 2.054601595447736 | 1.457 | 0.865 | 0.615 |
| 2.057743188101325 | 1.454 | 0.865 | 0.615 |
| 2.060884780754915 | 1.452 | 0.865 | 0.616 |
| 2.064026373408505 | 1.45 | 0.866 | 0.617 |
| 2.067167966062094 | 1.448 | 0.866 | 0.618 |
| 2.070309558715684 | 1.446 | 0.866 | 0.619 |
| 2.073451151369273 | 1.443 | 0.867 | 0.619 |
| 2.076592744022863 | 1.441 | 0.867 | 0.62 |
| 2.079734336676452 | 1.439 | 0.868 | 0.621 |
| 2.082875929330042 | 1.437 | 0.868 | 0.622 |
| 2.086017521983632 | 1.434 | 0.868 | 0.623 |
| 2.089159114637221 | 1.432 | 0.869 | 0.624 |
| 2.092300707290811 | 1.43 | 0.869 | 0.624 |
| 2.095442299944401 | 1.428 | 0.87 | 0.625 |
| 2.09858389259799 | 1.426 | 0.87 | 0.626 |
| 2.10172548525158 | 1.423 | 0.871 | 0.627 |
| 2.104867077905169 | 1.421 | 0.871 | 0.628 |
| 2.108008670558759 | 1.419 | 0.871 | 0.629 |
| 2.111150263212349 | 1.417 | 0.872 | 0.63 |
| 2.114291855865938 | 1.414 | 0.872 | 0.63 |
| 2.117433448519528 | 1.412 | 0.873 | 0.631 |
| 2.120575041173117 | 1.41 | 0.873 | 0.632 |
| 2.123716633826707 | 1.408 | 0.873 | 0.633 |
| 2.126858226480297 | 1.406 | 0.874 | 0.634 |
| 2.129999819133886 | 1.403 | 0.874 | 0.635 |
| 2.133141411787476 | 1.401 | 0.875 | 0.636 |
| 2.136283004441065 | 1.399 | 0.875 | 0.637 |
| 2.139424597094655 | 1.397 | 0.876 | 0.638 |
| 2.142566189748245 | 1.394 | 0.876 | 0.639 |
| 2.145707782401834 | 1.392 | 0.877 | 0.64 |
| 2.148849375055424 | 1.39 | 0.877 | 0.641 |
| 2.151990967709013 | 1.388 | 0.877 | 0.641 |
| 2.155132560362603 | 1.386 | 0.878 | 0.642 |
| 2.158274153016193 | 1.383 | 0.878 | 0.643 |
| 2.161415745669782 | 1.381 | 0.879 | 0.644 |
| 2.164557338323372 | 1.379 | 0.879 | 0.645 |
| 2.167698930976961 | 1.377 | 0.88 | 0.646 |
| 2.170840523630551 | 1.374 | 0.88 | 0.647 |
| 2.173982116284141 | 1.372 | 0.881 | 0.648 |
| 2.17712370893773 | 1.37 | 0.881 | 0.649 |
| 2.18026530159132 | 1.368 | 0.881 | 0.65 |
| 2.183406894244909 | 1.366 | 0.882 | 0.651 |
| 2.186548486898499 | 1.363 | 0.882 | 0.652 |
| 2.189690079552089 | 1.361 | 0.883 | 0.653 |
| 2.192831672205678 | 1.359 | 0.883 | 0.654 |
| 2.195973264859268 | 1.357 | 0.884 | 0.655 |
| 2.199114857512857 | 1.355 | 0.884 | 0.656 |
| 2.202256450166447 | 1.352 | 0.885 | 0.657 |
| 2.205398042820036 | 1.35 | 0.885 | 0.658 |
| 2.208539635473626 | 1.348 | 0.886 | 0.659 |
| 2.211681228127216 | 1.346 | 0.886 | 0.66 |
| 2.214822820780805 | 1.344 | 0.887 | 0.662 |
| 2.217964413434395 | 1.342 | 0.887 | 0.663 |
| 2.221106006087984 | 1.339 | 0.888 | 0.664 |
| 2.224247598741574 | 1.337 | 0.888 | 0.665 |
| 2.227389191395164 | 1.335 | 0.889 | 0.666 |
| 2.230530784048753 | 1.333 | 0.889 | 0.667 |
| 2.233672376702343 | 1.331 | 0.889 | 0.668 |
| 2.236813969355933 | 1.329 | 0.89 | 0.669 |
| 2.239955562009522 | 1.326 | 0.89 | 0.67 |
| 2.243097154663112 | 1.324 | 0.891 | 0.671 |
| 2.246238747316701 | 1.322 | 0.891 | 0.672 |
| 2.249380339970291 | 1.32 | 0.892 | 0.673 |
| 2.252521932623881 | 1.318 | 0.892 | 0.675 |
| 2.25566352527747 | 1.316 | 0.893 | 0.676 |
| 2.25880511793106 | 1.314 | 0.893 | 0.677 |
| 2.261946710584649 | 1.311 | 0.894 | 0.678 |
| 2.265088303238239 | 1.309 | 0.894 | 0.679 |
| 2.268229895891829 | 1.307 | 0.895 | 0.68 |
| 2.271371488545418 | 1.305 | 0.895 | 0.681 |
| 2.274513081199008 | 1.303 | 0.896 | 0.683 |
| 2.277654673852597 | 1.301 | 0.896 | 0.684 |
| 2.280796266506186 | 1.299 | 0.897 | 0.685 |
| 2.283937859159776 | 1.297 | 0.897 | 0.686 |
| 2.287079451813366 | 1.295 | 0.898 | 0.687 |
| 2.290221044466955 | 1.293 | 0.898 | 0.688 |
| 2.293362637120545 | 1.29 | 0.899 | 0.69 |
| 2.296504229774135 | 1.288 | 0.899 | 0.691 |
| 2.299645822427724 | 1.286 | 0.9 | 0.692 |
| 2.302787415081314 | 1.284 | 0.9 | 0.693 |
| 2.305929007734904 | 1.282 | 0.901 | 0.694 |
| 2.309070600388493 | 1.28 | 0.901 | 0.696 |
| 2.312212193042083 | 1.278 | 0.902 | 0.697 |
| 2.315353785695672 | 1.276 | 0.902 | 0.698 |
| 2.318495378349262 | 1.274 | 0.903 | 0.699 |
| 2.321636971002852 | 1.272 | 0.903 | 0.7 |
| 2.324778563656441 | 1.27 | 0.904 | 0.702 |
| 2.327920156310031 | 1.268 | 0.904 | 0.703 |
| 2.33106174896362 | 1.266 | 0.905 | 0.704 |
| 2.33420334161721 | 1.264 | 0.905 | 0.705 |
| 2.3373449342708 | 1.262 | 0.906 | 0.707 |
| 2.340486526924389 | 1.26 | 0.907 | 0.708 |
| 2.343628119577979 | 1.258 | 0.907 | 0.709 |
| 2.346769712231568 | 1.256 | 0.908 | 0.71 |
| 2.349911304885158 | 1.254 | 0.908 | 0.712 |
| 2.353052897538748 | 1.252 | 0.909 | 0.713 |
| 2.356194490192337 | 1.25 | 0.909 | 0.714 |
| 2.359336082845927 | 1.248 | 0.91 | 0.716 |
| 2.362477675499516 | 1.246 | 0.91 | 0.717 |
| 2.365619268153106 | 1.244 | 0.911 | 0.718 |
| 2.368760860806696 | 1.242 | 0.911 | 0.719 |
| 2.371902453460285 | 1.24 | 0.912 | 0.721 |
| 2.375044046113875 | 1.238 | 0.912 | 0.722 |
| 2.378185638767464 | 1.236 | 0.913 | 0.723 |
| 2.381327231421054 | 1.234 | 0.913 | 0.725 |
| 2.384468824074644 | 1.233 | 0.914 | 0.726 |
| 2.387610416728233 | 1.231 | 0.914 | 0.727 |
| 2.390752009381823 | 1.229 | 0.915 | 0.729 |
| 2.393893602035412 | 1.227 | 0.915 | 0.73 |
| 2.397035194689002 | 1.225 | 0.916 | 0.731 |
| 2.400176787342591 | 1.223 | 0.916 | 0.733 |
| 2.403318379996181 | 1.221 | 0.917 | 0.734 |
| 2.406459972649771 | 1.219 | 0.917 | 0.735 |
| 2.40960156530336 | 1.218 | 0.918 | 0.737 |
| 2.41274315795695 | 1.216 | 0.919 | 0.738 |
| 2.41588475061054 | 1.214 | 0.919 | 0.739 |
| 2.419026343264129 | 1.212 | 0.92 | 0.741 |
| 2.422167935917719 | 1.21 | 0.92 | 0.742 |
| 2.425309528571308 | 1.208 | 0.921 | 0.744 |
| 2.428451121224898 | 1.207 | 0.921 | 0.745 |
| 2.431592713878488 | 1.205 | 0.922 | 0.746 |
| 2.434734306532077 | 1.203 | 0.922 | 0.748 |
| 2.437875899185667 | 1.201 | 0.923 | 0.749 |
| 2.441017491839256 | 1.199 | 0.923 | 0.75 |
| 2.444159084492846 | 1.198 | 0.924 | 0.752 |
| 2.447300677146435 | 1.196 | 0.924 | 0.753 |
| 2.450442269800025 | 1.194 | 0.925 | 0.755 |
| 2.453583862453615 | 1.192 | 0.925 | 0.756 |
| 2.456725455107204 | 1.191 | 0.926 | 0.758 |
| 2.459867047760794 | 1.189 | 0.926 | 0.759 |
| 2.463008640414384 | 1.187 | 0.927 | 0.76 |
| 2.466150233067973 | 1.185 | 0.927 | 0.762 |
| 2.469291825721563 | 1.184 | 0.928 | 0.763 |
| 2.472433418375152 | 1.182 | 0.929 | 0.765 |
| 2.475575011028742 | 1.18 | 0.929 | 0.766 |
| 2.478716603682332 | 1.179 | 0.93 | 0.767 |
| 2.481858196335921 | 1.177 | 0.93 | 0.769 |
| 2.48499978898951 | 1.175 | 0.931 | 0.77 |
| 2.4881413816431 | 1.173 | 0.931 | 0.772 |
| 2.49128297429669 | 1.172 | 0.932 | 0.773 |
| 2.49442456695028 | 1.17 | 0.932 | 0.775 |
| 2.497566159603869 | 1.168 | 0.933 | 0.776 |
| 2.500707752257458 | 1.167 | 0.933 | 0.778 |
| 2.503849344911048 | 1.165 | 0.934 | 0.779 |
| 2.506990937564638 | 1.164 | 0.934 | 0.781 |
| 2.510132530218228 | 1.162 | 0.935 | 0.782 |
| 2.513274122871817 | 1.16 | 0.935 | 0.783 |
| 2.516415715525407 | 1.159 | 0.936 | 0.785 |
| 2.519557308178996 | 1.157 | 0.936 | 0.786 |
| 2.522698900832586 | 1.156 | 0.937 | 0.788 |
| 2.525840493486176 | 1.154 | 0.937 | 0.789 |
| 2.528982086139765 | 1.152 | 0.938 | 0.791 |
| 2.532123678793355 | 1.151 | 0.938 | 0.792 |
| 2.535265271446944 | 1.149 | 0.939 | 0.794 |
| 2.538406864100534 | 1.148 | 0.94 | 0.795 |
| 2.541548456754124 | 1.146 | 0.94 | 0.797 |
| 2.544690049407713 | 1.145 | 0.941 | 0.798 |
| 2.547831642061302 | 1.143 | 0.941 | 0.8 |
| 2.550973234714892 | 1.142 | 0.942 | 0.801 |
| 2.554114827368482 | 1.14 | 0.942 | 0.803 |
| 2.557256420022072 | 1.139 | 0.943 | 0.804 |
| 2.560398012675661 | 1.137 | 0.943 | 0.806 |
| 2.563539605329251 | 1.136 | 0.944 | 0.807 |
| 2.56668119798284 | 1.134 | 0.944 | 0.809 |
| 2.56982279063643 | 1.133 | 0.945 | 0.81 |
| 2.57296438329002 | 1.131 | 0.945 | 0.812 |
| 2.576105975943609 | 1.13 | 0.946 | 0.813 |
| 2.579247568597199 | 1.128 | 0.946 | 0.815 |
| 2.582389161250788 | 1.127 | 0.947 | 0.816 |
| 2.585530753904377 | 1.125 | 0.947 | 0.818 |
| 2.588672346557967 | 1.124 | 0.948 | 0.819 |
| 2.591813939211557 | 1.123 | 0.948 | 0.821 |
| 2.594955531865147 | 1.121 | 0.949 | 0.822 |
| 2.598097124518736 | 1.12 | 0.949 | 0.824 |
| 2.601238717172326 | 1.118 | 0.95 | 0.825 |
| 2.604380309825915 | 1.117 | 0.95 | 0.827 |
| 2.607521902479505 | 1.116 | 0.951 | 0.828 |
| 2.610663495133095 | 1.114 | 0.951 | 0.83 |
| 2.613805087786684 | 1.113 | 0.952 | 0.831 |
| 2.616946680440274 | 1.112 | 0.952 | 0.833 |
| 2.620088273093863 | 1.11 | 0.953 | 0.834 |
| 2.623229865747452 | 1.109 | 0.953 | 0.836 |
| 2.626371458401042 | 1.108 | 0.954 | 0.837 |
| 2.629513051054632 | 1.106 | 0.954 | 0.839 |
| 2.632654643708222 | 1.105 | 0.955 | 0.84 |
| 2.635796236361811 | 1.104 | 0.955 | 0.842 |
| 2.638937829015401 | 1.102 | 0.956 | 0.843 |
| 2.642079421668991 | 1.101 | 0.956 | 0.845 |
| 2.64522101432258 | 1.1 | 0.957 | 0.846 |
| 2.64836260697617 | 1.099 | 0.957 | 0.848 |
| 2.651504199629759 | 1.097 | 0.958 | 0.849 |
| 2.654645792283349 | 1.096 | 0.958 | 0.851 |
| 2.657787384936938 | 1.095 | 0.959 | 0.852 |
| 2.660928977590528 | 1.094 | 0.959 | 0.854 |
| 2.664070570244118 | 1.092 | 0.959 | 0.855 |
| 2.667212162897707 | 1.091 | 0.96 | 0.857 |
| 2.670353755551297 | 1.09 | 0.96 | 0.858 |
| 2.673495348204887 | 1.089 | 0.961 | 0.86 |
| 2.676636940858476 | 1.087 | 0.961 | 0.861 |
| 2.679778533512066 | 1.086 | 0.962 | 0.863 |
| 2.682920126165655 | 1.085 | 0.962 | 0.864 |
| 2.686061718819245 | 1.084 | 0.963 | 0.866 |
| 2.689203311472835 | 1.083 | 0.963 | 0.867 |
| 2.692344904126424 | 1.082 | 0.964 | 0.869 |
| 2.695486496780014 | 1.08 | 0.964 | 0.87 |
| 2.698628089433603 | 1.079 | 0.965 | 0.872 |
| 2.701769682087193 | 1.078 | 0.965 | 0.873 |
| 2.704911274740782 | 1.077 | 0.965 | 0.875 |
| 2.708052867394372 | 1.076 | 0.966 | 0.876 |
| 2.711194460047962 | 1.075 | 0.966 | 0.878 |
| 2.714336052701551 | 1.074 | 0.967 | 0.879 |
| 2.717477645355141 | 1.073 | 0.967 | 0.881 |
| 2.720619238008731 | 1.072 | 0.968 | 0.882 |
| 2.72376083066232 | 1.071 | 0.968 | 0.884 |
| 2.72690242331591 | 1.069 | 0.969 | 0.885 |
| 2.730044015969499 | 1.068 | 0.969 | 0.887 |
| 2.733185608623089 | 1.067 | 0.969 | 0.888 |
| 2.736327201276678 | 1.066 | 0.97 | 0.889 |
| 2.739468793930268 | 1.065 | 0.97 | 0.891 |
| 2.742610386583858 | 1.064 | 0.971 | 0.892 |
| 2.745751979237447 | 1.063 | 0.971 | 0.894 |
| 2.748893571891036 | 1.062 | 0.972 | 0.895 |
| 2.752035164544627 | 1.061 | 0.972 | 0.897 |
| 2.755176757198216 | 1.06 | 0.972 | 0.898 |
| 2.758318349851806 | 1.059 | 0.973 | 0.899 |
| 2.761459942505395 | 1.058 | 0.973 | 0.901 |
| 2.764601535158985 | 1.057 | 0.974 | 0.902 |
| 2.767743127812574 | 1.056 | 0.974 | 0.904 |
| 2.770884720466164 | 1.055 | 0.974 | 0.905 |
| 2.774026313119754 | 1.054 | 0.975 | 0.906 |
| 2.777167905773343 | 1.054 | 0.975 | 0.908 |
| 2.780309498426932 | 1.053 | 0.976 | 0.909 |
| 2.783451091080522 | 1.052 | 0.976 | 0.91 |
| 2.786592683734112 | 1.051 | 0.976 | 0.912 |
| 2.789734276387701 | 1.05 | 0.977 | 0.913 |
| 2.792875869041291 | 1.049 | 0.977 | 0.915 |
| 2.796017461694881 | 1.048 | 0.978 | 0.916 |
| 2.79915905434847 | 1.047 | 0.978 | 0.917 |
| 2.80230064700206 | 1.046 | 0.978 | 0.919 |
| 2.80544223965565 | 1.046 | 0.979 | 0.92 |
| 2.808583832309239 | 1.045 | 0.979 | 0.921 |
| 2.811725424962829 | 1.044 | 0.979 | 0.923 |
| 2.814867017616419 | 1.043 | 0.98 | 0.924 |
| 2.818008610270008 | 1.042 | 0.98 | 0.925 |
| 2.821150202923598 | 1.041 | 0.981 | 0.926 |
| 2.824291795577187 | 1.041 | 0.981 | 0.928 |
| 2.827433388230777 | 1.04 | 0.981 | 0.929 |
| 2.830574980884366 | 1.039 | 0.982 | 0.93 |
| 2.833716573537956 | 1.038 | 0.982 | 0.932 |
| 2.836858166191546 | 1.037 | 0.982 | 0.933 |
| 2.839999758845135 | 1.037 | 0.983 | 0.934 |
| 2.843141351498725 | 1.036 | 0.983 | 0.935 |
| 2.846282944152314 | 1.035 | 0.983 | 0.937 |
| 2.849424536805904 | 1.034 | 0.984 | 0.938 |
| 2.852566129459494 | 1.034 | 0.984 | 0.939 |
| 2.855707722113083 | 1.033 | 0.984 | 0.94 |
| 2.858849314766673 | 1.032 | 0.985 | 0.941 |
| 2.861990907420262 | 1.031 | 0.985 | 0.943 |
| 2.865132500073852 | 1.031 | 0.985 | 0.944 |
| 2.868274092727442 | 1.03 | 0.986 | 0.945 |
| 2.871415685381031 | 1.029 | 0.986 | 0.946 |
| 2.874557278034621 | 1.029 | 0.986 | 0.947 |
| 2.87769887068821 | 1.028 | 0.987 | 0.948 |
| 2.8808404633418 | 1.027 | 0.987 | 0.95 |
| 2.88398205599539 | 1.027 | 0.987 | 0.951 |
| 2.88712364864898 | 1.026 | 0.987 | 0.952 |
| 2.890265241302569 | 1.025 | 0.988 | 0.953 |
| 2.893406833956158 | 1.025 | 0.988 | 0.954 |
| 2.896548426609748 | 1.024 | 0.988 | 0.955 |
| 2.899690019263338 | 1.023 | 0.989 | 0.956 |
| 2.902831611916927 | 1.023 | 0.989 | 0.957 |
| 2.905973204570517 | 1.022 | 0.989 | 0.958 |
| 2.909114797224106 | 1.022 | 0.989 | 0.959 |
| 2.912256389877696 | 1.021 | 0.99 | 0.96 |
| 2.915397982531286 | 1.021 | 0.99 | 0.961 |
| 2.918539575184875 | 1.02 | 0.99 | 0.962 |
| 2.921681167838465 | 1.019 | 0.991 | 0.963 |
| 2.924822760492054 | 1.019 | 0.991 | 0.964 |
| 2.927964353145644 | 1.018 | 0.991 | 0.965 |
| 2.931105945799234 | 1.018 | 0.991 | 0.966 |
| 2.934247538452823 | 1.017 | 0.992 | 0.967 |
| 2.937389131106413 | 1.017 | 0.992 | 0.968 |
| 2.940530723760002 | 1.016 | 0.992 | 0.969 |
| 2.943672316413592 | 1.016 | 0.992 | 0.97 |
| 2.946813909067182 | 1.015 | 0.993 | 0.971 |
| 2.949955501720771 | 1.015 | 0.993 | 0.972 |
| 2.953097094374361 | 1.014 | 0.993 | 0.973 |
| 2.95623868702795 | 1.014 | 0.993 | 0.974 |
| 2.95938027968154 | 1.013 | 0.993 | 0.974 |
| 2.96252187233513 | 1.013 | 0.994 | 0.975 |
| 2.965663464988719 | 1.012 | 0.994 | 0.976 |
| 2.968805057642309 | 1.012 | 0.994 | 0.977 |
| 2.971946650295898 | 1.012 | 0.994 | 0.978 |
| 2.975088242949488 | 1.011 | 0.995 | 0.978 |
| 2.978229835603078 | 1.011 | 0.995 | 0.979 |
| 2.981371428256667 | 1.01 | 0.995 | 0.98 |
| 2.984513020910257 | 1.01 | 0.995 | 0.981 |
| 2.987654613563846 | 1.009 | 0.995 | 0.982 |
| 2.990796206217436 | 1.009 | 0.996 | 0.982 |
| 2.993937798871025 | 1.009 | 0.996 | 0.983 |
| 2.997079391524615 | 1.008 | 0.996 | 0.984 |
| 3.000220984178205 | 1.008 | 0.996 | 0.984 |
| 3.003362576831794 | 1.008 | 0.996 | 0.985 |
| 3.006504169485384 | 1.007 | 0.996 | 0.986 |
| 3.009645762138974 | 1.007 | 0.997 | 0.986 |
| 3.012787354792563 | 1.007 | 0.997 | 0.987 |
| 3.015928947446153 | 1.006 | 0.997 | 0.988 |
| 3.019070540099742 | 1.006 | 0.997 | 0.988 |
| 3.022212132753332 | 1.006 | 0.997 | 0.989 |
| 3.025353725406922 | 1.005 | 0.997 | 0.989 |
| 3.028495318060511 | 1.005 | 0.997 | 0.99 |
| 3.031636910714101 | 1.005 | 0.998 | 0.99 |
| 3.03477850336769 | 1.005 | 0.998 | 0.991 |
| 3.03792009602128 | 1.004 | 0.998 | 0.992 |
| 3.04106168867487 | 1.004 | 0.998 | 0.992 |
| 3.04420328132846 | 1.004 | 0.998 | 0.992 |
| 3.047344873982049 | 1.004 | 0.998 | 0.993 |
| 3.050486466635638 | 1.003 | 0.998 | 0.993 |
| 3.053628059289228 | 1.003 | 0.998 | 0.994 |
| 3.056769651942818 | 1.003 | 0.999 | 0.994 |
| 3.059911244596407 | 1.003 | 0.999 | 0.995 |
| 3.063052837249997 | 1.002 | 0.999 | 0.995 |
| 3.066194429903586 | 1.002 | 0.999 | 0.995 |
| 3.069336022557176 | 1.002 | 0.999 | 0.996 |
| 3.072477615210766 | 1.002 | 0.999 | 0.996 |
| 3.075619207864355 | 1.002 | 0.999 | 0.997 |
| 3.078760800517945 | 1.002 | 0.999 | 0.997 |
| 3.081902393171534 | 1.001 | 0.999 | 0.997 |
| 3.085043985825124 | 1.001 | 0.999 | 0.997 |
| 3.088185578478713 | 1.001 | 0.999 | 0.998 |
| 3.091327171132303 | 1.001 | 0.999 | 0.998 |
| 3.094468763785893 | 1.001 | 1 | 0.998 |
| 3.097610356439482 | 1.001 | 1 | 0.998 |
| 3.100751949093072 | 1.001 | 1 | 0.999 |
| 3.103893541746661 | 1.001 | 1 | 0.999 |
| 3.107035134400251 | 1 | 1 | 0.999 |
| 3.110176727053841 | 1 | 1 | 0.999 |
| 3.11331831970743 | 1 | 1 | 0.999 |
| 3.11645991236102 | 1 | 1 | 0.999 |
| 3.11960150501461 | 1 | 1 | 1 |
| 3.122743097668199 | 1 | 1 | 1 |
| 3.125884690321789 | 1 | 1 | 1 |
| 3.129026282975378 | 1 | 1 | 1 |
| 3.132167875628968 | 1 | 1 | 1 |
| 3.135309468282557 | 1 | 1 | 1 |
| 3.138451060936147 | 1 | 1 | 1 |
| 3.141592653589737 | 1 | 1 | 1 |
| 3.144734246243326 | 1 | 1 | 1 |
| 3.147875838896916 | 1 | 1 | 1 |
| 3.151017431550505 | 1 | 1 | 1 |
| 3.154159024204095 | 1 | 1 | 1 |
| 3.157300616857685 | 1 | 1 | 1 |
| 3.160442209511274 | 1 | 1 | 1 |
| 3.163583802164864 | 1 | 1 | 1 |
| 3.166725394818453 | 1 | 1 | 0.999 |
| 3.169866987472043 | 1 | 1 | 0.999 |
| 3.173008580125633 | 1 | 1 | 0.999 |
| 3.176150172779222 | 1 | 1 | 0.999 |
| 3.179291765432812 | 1.001 | 1 | 0.999 |
| 3.182433358086401 | 1.001 | 1 | 0.999 |
| 3.185574950739991 | 1.001 | 1 | 0.998 |
| 3.188716543393581 | 1.001 | 1 | 0.998 |
| 3.19185813604717 | 1.001 | 0.999 | 0.998 |
| 3.19499972870076 | 1.001 | 0.999 | 0.998 |
| 3.198141321354349 | 1.001 | 0.999 | 0.997 |
| 3.20128291400794 | 1.001 | 0.999 | 0.997 |
| 3.204424506661528 | 1.002 | 0.999 | 0.997 |
| 3.207566099315118 | 1.002 | 0.999 | 0.997 |
| 3.210707691968708 | 1.002 | 0.999 | 0.996 |
| 3.213849284622297 | 1.002 | 0.999 | 0.996 |
| 3.216990877275887 | 1.002 | 0.999 | 0.995 |
| 3.220132469929476 | 1.002 | 0.999 | 0.995 |
| 3.223274062583066 | 1.003 | 0.999 | 0.995 |
| 3.226415655236656 | 1.003 | 0.999 | 0.994 |
| 3.229557247890245 | 1.003 | 0.998 | 0.994 |
| 3.232698840543835 | 1.003 | 0.998 | 0.993 |
| 3.235840433197425 | 1.004 | 0.998 | 0.993 |
| 3.238982025851014 | 1.004 | 0.998 | 0.992 |
| 3.242123618504604 | 1.004 | 0.998 | 0.992 |
| 3.245265211158193 | 1.004 | 0.998 | 0.992 |
| 3.248406803811783 | 1.005 | 0.998 | 0.991 |
| 3.251548396465373 | 1.005 | 0.998 | 0.99 |
| 3.254689989118962 | 1.005 | 0.997 | 0.99 |
| 3.257831581772551 | 1.005 | 0.997 | 0.989 |
| 3.260973174426141 | 1.006 | 0.997 | 0.989 |
| 3.26411476707973 | 1.006 | 0.997 | 0.988 |
| 3.267256359733321 | 1.006 | 0.997 | 0.988 |
| 3.27039795238691 | 1.007 | 0.997 | 0.987 |
| 3.2735395450405 | 1.007 | 0.997 | 0.986 |
| 3.276681137694089 | 1.007 | 0.996 | 0.986 |
| 3.279822730347679 | 1.008 | 0.996 | 0.985 |
| 3.282964323001269 | 1.008 | 0.996 | 0.984 |
| 3.286105915654858 | 1.008 | 0.996 | 0.984 |
| 3.289247508308448 | 1.009 | 0.996 | 0.983 |
| 3.292389100962037 | 1.009 | 0.996 | 0.982 |
| 3.295530693615627 | 1.009 | 0.995 | 0.982 |
| 3.298672286269217 | 1.01 | 0.995 | 0.981 |
| 3.301813878922806 | 1.01 | 0.995 | 0.98 |
| 3.304955471576396 | 1.011 | 0.995 | 0.979 |
| 3.308097064229985 | 1.011 | 0.995 | 0.978 |
| 3.311238656883575 | 1.012 | 0.994 | 0.978 |
| 3.314380249537165 | 1.012 | 0.994 | 0.977 |
| 3.317521842190754 | 1.012 | 0.994 | 0.976 |
| 3.320663434844344 | 1.013 | 0.994 | 0.975 |
| 3.323805027497933 | 1.013 | 0.993 | 0.974 |
| 3.326946620151523 | 1.014 | 0.993 | 0.974 |
| 3.330088212805113 | 1.014 | 0.993 | 0.973 |
| 3.333229805458702 | 1.015 | 0.993 | 0.972 |
| 3.336371398112292 | 1.015 | 0.993 | 0.971 |
| 3.339512990765881 | 1.016 | 0.992 | 0.97 |
| 3.342654583419471 | 1.016 | 0.992 | 0.969 |
| 3.345796176073061 | 1.017 | 0.992 | 0.968 |
| 3.34893776872665 | 1.017 | 0.992 | 0.967 |
| 3.35207936138024 | 1.018 | 0.991 | 0.966 |
| 3.355220954033829 | 1.018 | 0.991 | 0.965 |
| 3.358362546687419 | 1.019 | 0.991 | 0.964 |
| 3.361504139341009 | 1.019 | 0.991 | 0.963 |
| 3.364645731994598 | 1.02 | 0.99 | 0.962 |
| 3.367787324648188 | 1.021 | 0.99 | 0.961 |
| 3.370928917301777 | 1.021 | 0.99 | 0.96 |
| 3.374070509955367 | 1.022 | 0.989 | 0.959 |
| 3.377212102608956 | 1.022 | 0.989 | 0.958 |
| 3.380353695262546 | 1.023 | 0.989 | 0.957 |
| 3.383495287916136 | 1.023 | 0.989 | 0.956 |
| 3.386636880569725 | 1.024 | 0.988 | 0.955 |
| 3.389778473223315 | 1.025 | 0.988 | 0.954 |
| 3.392920065876904 | 1.025 | 0.988 | 0.953 |
| 3.396061658530494 | 1.026 | 0.987 | 0.952 |
| 3.399203251184084 | 1.027 | 0.987 | 0.951 |
| 3.402344843837673 | 1.027 | 0.987 | 0.95 |
| 3.405486436491263 | 1.028 | 0.987 | 0.948 |
| 3.408628029144852 | 1.029 | 0.986 | 0.947 |
| 3.411769621798442 | 1.029 | 0.986 | 0.946 |
| 3.414911214452032 | 1.03 | 0.986 | 0.945 |
| 3.418052807105621 | 1.031 | 0.985 | 0.944 |
| 3.421194399759211 | 1.031 | 0.985 | 0.943 |
| 3.4243359924128 | 1.032 | 0.985 | 0.941 |
| 3.42747758506639 | 1.033 | 0.984 | 0.94 |
| 3.43061917771998 | 1.034 | 0.984 | 0.939 |
| 3.433760770373569 | 1.034 | 0.984 | 0.938 |
| 3.436902363027159 | 1.035 | 0.983 | 0.937 |
| 3.440043955680748 | 1.036 | 0.983 | 0.935 |
| 3.443185548334338 | 1.037 | 0.983 | 0.934 |
| 3.446327140987927 | 1.037 | 0.982 | 0.933 |
| 3.449468733641517 | 1.038 | 0.982 | 0.932 |
| 3.452610326295107 | 1.039 | 0.982 | 0.93 |
| 3.455751918948696 | 1.04 | 0.981 | 0.929 |
| 3.458893511602286 | 1.041 | 0.981 | 0.928 |
| 3.462035104255876 | 1.041 | 0.981 | 0.926 |
| 3.465176696909465 | 1.042 | 0.98 | 0.925 |
| 3.468318289563055 | 1.043 | 0.98 | 0.924 |
| 3.471459882216644 | 1.044 | 0.979 | 0.923 |
| 3.474601474870234 | 1.045 | 0.979 | 0.921 |
| 3.477743067523824 | 1.046 | 0.979 | 0.92 |
| 3.480884660177413 | 1.046 | 0.978 | 0.919 |
| 3.484026252831002 | 1.047 | 0.978 | 0.917 |
| 3.487167845484592 | 1.048 | 0.978 | 0.916 |
| 3.490309438138182 | 1.049 | 0.977 | 0.915 |
| 3.493451030791772 | 1.05 | 0.977 | 0.913 |
| 3.496592623445361 | 1.051 | 0.976 | 0.912 |
| 3.499734216098951 | 1.052 | 0.976 | 0.91 |
| 3.50287580875254 | 1.053 | 0.976 | 0.909 |
| 3.50601740140613 | 1.054 | 0.975 | 0.908 |
| 3.50915899405972 | 1.054 | 0.975 | 0.906 |
| 3.512300586713309 | 1.055 | 0.974 | 0.905 |
| 3.515442179366899 | 1.056 | 0.974 | 0.904 |
| 3.518583772020488 | 1.057 | 0.974 | 0.902 |
| 3.521725364674078 | 1.058 | 0.973 | 0.901 |
| 3.524866957327668 | 1.059 | 0.973 | 0.899 |
| 3.528008549981257 | 1.06 | 0.972 | 0.898 |
| 3.531150142634847 | 1.061 | 0.972 | 0.897 |
| 3.534291735288436 | 1.062 | 0.972 | 0.895 |
| 3.537433327942026 | 1.063 | 0.971 | 0.894 |
| 3.540574920595616 | 1.064 | 0.971 | 0.892 |
| 3.543716513249205 | 1.065 | 0.97 | 0.891 |
| 3.546858105902795 | 1.066 | 0.97 | 0.889 |
| 3.549999698556384 | 1.067 | 0.969 | 0.888 |
| 3.553141291209974 | 1.068 | 0.969 | 0.887 |
| 3.556282883863564 | 1.069 | 0.969 | 0.885 |
| 3.559424476517153 | 1.071 | 0.968 | 0.884 |
| 3.562566069170743 | 1.072 | 0.968 | 0.882 |
| 3.565707661824332 | 1.073 | 0.967 | 0.881 |
| 3.568849254477922 | 1.074 | 0.967 | 0.879 |
| 3.571990847131511 | 1.075 | 0.966 | 0.878 |
| 3.575132439785101 | 1.076 | 0.966 | 0.876 |
| 3.578274032438691 | 1.077 | 0.965 | 0.875 |
| 3.58141562509228 | 1.078 | 0.965 | 0.873 |
| 3.58455721774587 | 1.079 | 0.965 | 0.872 |
| 3.58769881039946 | 1.08 | 0.964 | 0.87 |
| 3.590840403053049 | 1.082 | 0.964 | 0.869 |
| 3.593981995706639 | 1.083 | 0.963 | 0.867 |
| 3.597123588360228 | 1.084 | 0.963 | 0.866 |
| 3.600265181013818 | 1.085 | 0.962 | 0.864 |
| 3.603406773667407 | 1.086 | 0.962 | 0.863 |
| 3.606548366320997 | 1.087 | 0.961 | 0.861 |
| 3.609689958974587 | 1.089 | 0.961 | 0.86 |
| 3.612831551628176 | 1.09 | 0.96 | 0.858 |
| 3.615973144281766 | 1.091 | 0.96 | 0.857 |
| 3.619114736935355 | 1.092 | 0.959 | 0.855 |
| 3.622256329588945 | 1.094 | 0.959 | 0.854 |
| 3.625397922242534 | 1.095 | 0.959 | 0.852 |
| 3.628539514896124 | 1.096 | 0.958 | 0.851 |
| 3.631681107549714 | 1.097 | 0.958 | 0.849 |
| 3.634822700203303 | 1.099 | 0.957 | 0.848 |
| 3.637964292856893 | 1.1 | 0.957 | 0.846 |
| 3.641105885510483 | 1.101 | 0.956 | 0.845 |
| 3.644247478164072 | 1.102 | 0.956 | 0.843 |
| 3.647389070817662 | 1.104 | 0.955 | 0.842 |
| 3.650530663471251 | 1.105 | 0.955 | 0.84 |
| 3.653672256124841 | 1.106 | 0.954 | 0.839 |
| 3.656813848778431 | 1.108 | 0.954 | 0.837 |
| 3.65995544143202 | 1.109 | 0.953 | 0.836 |
| 3.66309703408561 | 1.11 | 0.953 | 0.834 |
| 3.666238626739199 | 1.112 | 0.952 | 0.833 |
| 3.66938021939279 | 1.113 | 0.952 | 0.831 |
| 3.672521812046378 | 1.114 | 0.951 | 0.83 |
| 3.675663404699968 | 1.116 | 0.951 | 0.828 |
| 3.678804997353558 | 1.117 | 0.95 | 0.827 |
| 3.681946590007147 | 1.118 | 0.95 | 0.825 |
| 3.685088182660737 | 1.12 | 0.949 | 0.824 |
| 3.688229775314326 | 1.121 | 0.949 | 0.822 |
| 3.691371367967916 | 1.123 | 0.948 | 0.821 |
| 3.694512960621506 | 1.124 | 0.948 | 0.819 |
| 3.697654553275095 | 1.125 | 0.947 | 0.818 |
| 3.700796145928685 | 1.127 | 0.947 | 0.816 |
| 3.703937738582274 | 1.128 | 0.946 | 0.815 |
| 3.707079331235864 | 1.13 | 0.946 | 0.813 |
| 3.710220923889454 | 1.131 | 0.945 | 0.812 |
| 3.713362516543043 | 1.133 | 0.945 | 0.81 |
| 3.716504109196633 | 1.134 | 0.944 | 0.809 |
| 3.719645701850223 | 1.136 | 0.944 | 0.807 |
| 3.722787294503812 | 1.137 | 0.943 | 0.806 |
| 3.725928887157402 | 1.139 | 0.943 | 0.804 |
| 3.729070479810991 | 1.14 | 0.942 | 0.803 |
| 3.732212072464581 | 1.142 | 0.942 | 0.801 |
| 3.735353665118171 | 1.143 | 0.941 | 0.8 |
| 3.73849525777176 | 1.145 | 0.941 | 0.798 |
| 3.74163685042535 | 1.146 | 0.94 | 0.797 |
| 3.744778443078939 | 1.148 | 0.94 | 0.795 |
| 3.747920035732529 | 1.149 | 0.939 | 0.794 |
| 3.751061628386119 | 1.151 | 0.938 | 0.792 |
| 3.754203221039708 | 1.152 | 0.938 | 0.791 |
| 3.757344813693298 | 1.154 | 0.937 | 0.789 |
| 3.760486406346887 | 1.156 | 0.937 | 0.788 |
| 3.763627999000477 | 1.157 | 0.936 | 0.786 |
| 3.766769591654067 | 1.159 | 0.936 | 0.785 |
| 3.769911184307656 | 1.16 | 0.935 | 0.783 |
| 3.773052776961246 | 1.162 | 0.935 | 0.782 |
| 3.776194369614835 | 1.164 | 0.934 | 0.781 |
| 3.779335962268425 | 1.165 | 0.934 | 0.779 |
| 3.782477554922014 | 1.167 | 0.933 | 0.778 |
| 3.785619147575604 | 1.168 | 0.933 | 0.776 |
| 3.788760740229193 | 1.17 | 0.932 | 0.775 |
| 3.791902332882783 | 1.172 | 0.932 | 0.773 |
| 3.795043925536373 | 1.173 | 0.931 | 0.772 |
| 3.798185518189962 | 1.175 | 0.931 | 0.77 |
| 3.801327110843552 | 1.177 | 0.93 | 0.769 |
| 3.804468703497142 | 1.179 | 0.93 | 0.767 |
| 3.807610296150731 | 1.18 | 0.929 | 0.766 |
| 3.810751888804321 | 1.182 | 0.929 | 0.765 |
| 3.813893481457911 | 1.184 | 0.928 | 0.763 |
| 3.8170350741115 | 1.185 | 0.927 | 0.762 |
| 3.82017666676509 | 1.187 | 0.927 | 0.76 |
| 3.823318259418679 | 1.189 | 0.926 | 0.759 |
| 3.826459852072269 | 1.191 | 0.926 | 0.758 |
| 3.829601444725859 | 1.192 | 0.925 | 0.756 |
| 3.832743037379448 | 1.194 | 0.925 | 0.755 |
| 3.835884630033038 | 1.196 | 0.924 | 0.753 |
| 3.839026222686627 | 1.198 | 0.924 | 0.752 |
| 3.842167815340217 | 1.199 | 0.923 | 0.75 |
| 3.845309407993807 | 1.201 | 0.923 | 0.749 |
| 3.848451000647396 | 1.203 | 0.922 | 0.748 |
| 3.851592593300986 | 1.205 | 0.922 | 0.746 |
| 3.854734185954575 | 1.207 | 0.921 | 0.745 |
| 3.857875778608165 | 1.208 | 0.921 | 0.744 |
| 3.861017371261755 | 1.21 | 0.92 | 0.742 |
| 3.864158963915344 | 1.212 | 0.92 | 0.741 |
| 3.867300556568933 | 1.214 | 0.919 | 0.739 |
| 3.870442149222523 | 1.216 | 0.919 | 0.738 |
| 3.873583741876112 | 1.218 | 0.918 | 0.737 |
| 3.876725334529703 | 1.219 | 0.917 | 0.735 |
| 3.879866927183292 | 1.221 | 0.917 | 0.734 |
| 3.883008519836882 | 1.223 | 0.916 | 0.733 |
| 3.886150112490471 | 1.225 | 0.916 | 0.731 |
| 3.889291705144061 | 1.227 | 0.915 | 0.73 |
| 3.892433297797651 | 1.229 | 0.915 | 0.729 |
| 3.89557489045124 | 1.231 | 0.914 | 0.727 |
| 3.89871648310483 | 1.233 | 0.914 | 0.726 |
| 3.901858075758419 | 1.234 | 0.913 | 0.725 |
| 3.904999668412009 | 1.236 | 0.913 | 0.723 |
| 3.908141261065598 | 1.238 | 0.912 | 0.722 |
| 3.911282853719188 | 1.24 | 0.912 | 0.721 |
| 3.914424446372778 | 1.242 | 0.911 | 0.719 |
| 3.917566039026367 | 1.244 | 0.911 | 0.718 |
| 3.920707631679957 | 1.246 | 0.91 | 0.717 |
| 3.923849224333547 | 1.248 | 0.91 | 0.716 |
| 3.926990816987136 | 1.25 | 0.909 | 0.714 |
| 3.930132409640726 | 1.252 | 0.909 | 0.713 |
| 3.933274002294315 | 1.254 | 0.908 | 0.712 |
| 3.936415594947905 | 1.256 | 0.908 | 0.71 |
| 3.939557187601495 | 1.258 | 0.907 | 0.709 |
| 3.942698780255084 | 1.26 | 0.907 | 0.708 |
| 3.945840372908674 | 1.262 | 0.906 | 0.707 |
| 3.948981965562263 | 1.264 | 0.905 | 0.705 |
| 3.952123558215853 | 1.266 | 0.905 | 0.704 |
| 3.955265150869442 | 1.268 | 0.904 | 0.703 |
| 3.958406743523032 | 1.27 | 0.904 | 0.702 |
| 3.961548336176622 | 1.272 | 0.903 | 0.7 |
| 3.964689928830211 | 1.274 | 0.903 | 0.699 |
| 3.967831521483801 | 1.276 | 0.902 | 0.698 |
| 3.97097311413739 | 1.278 | 0.902 | 0.697 |
| 3.97411470679098 | 1.28 | 0.901 | 0.696 |
| 3.97725629944457 | 1.282 | 0.901 | 0.694 |
| 3.98039789209816 | 1.284 | 0.9 | 0.693 |
| 3.983539484751749 | 1.286 | 0.9 | 0.692 |
| 3.986681077405338 | 1.288 | 0.899 | 0.691 |
| 3.989822670058928 | 1.29 | 0.899 | 0.69 |
| 3.992964262712517 | 1.293 | 0.898 | 0.688 |
| 3.996105855366107 | 1.295 | 0.898 | 0.687 |
| 3.999247448019697 | 1.297 | 0.897 | 0.686 |
| 4.002389040673287 | 1.299 | 0.897 | 0.685 |
| 4.005530633326877 | 1.301 | 0.896 | 0.684 |
| 4.008672225980466 | 1.303 | 0.896 | 0.683 |
| 4.011813818634056 | 1.305 | 0.895 | 0.681 |
| 4.014955411287645 | 1.307 | 0.895 | 0.68 |
| 4.018097003941234 | 1.309 | 0.894 | 0.679 |
| 4.021238596594824 | 1.311 | 0.894 | 0.678 |
| 4.024380189248414 | 1.314 | 0.893 | 0.677 |
| 4.027521781902004 | 1.316 | 0.893 | 0.676 |
| 4.030663374555593 | 1.318 | 0.892 | 0.675 |
| 4.033804967209183 | 1.32 | 0.892 | 0.673 |
| 4.036946559862773 | 1.322 | 0.891 | 0.672 |
| 4.040088152516362 | 1.324 | 0.891 | 0.671 |
| 4.043229745169951 | 1.326 | 0.89 | 0.67 |
| 4.046371337823541 | 1.329 | 0.89 | 0.669 |
| 4.049512930477131 | 1.331 | 0.889 | 0.668 |
| 4.05265452313072 | 1.333 | 0.889 | 0.667 |
| 4.05579611578431 | 1.335 | 0.889 | 0.666 |
| 4.0589377084379 | 1.337 | 0.888 | 0.665 |
| 4.062079301091489 | 1.339 | 0.888 | 0.664 |
| 4.065220893745079 | 1.342 | 0.887 | 0.663 |
| 4.068362486398668 | 1.344 | 0.887 | 0.662 |
| 4.071504079052258 | 1.346 | 0.886 | 0.66 |
| 4.074645671705848 | 1.348 | 0.886 | 0.659 |
| 4.077787264359437 | 1.35 | 0.885 | 0.658 |
| 4.080928857013027 | 1.352 | 0.885 | 0.657 |
| 4.084070449666616 | 1.355 | 0.884 | 0.656 |
| 4.087212042320206 | 1.357 | 0.884 | 0.655 |
| 4.090353634973795 | 1.359 | 0.883 | 0.654 |
| 4.093495227627385 | 1.361 | 0.883 | 0.653 |
| 4.096636820280975 | 1.363 | 0.882 | 0.652 |
| 4.099778412934564 | 1.366 | 0.882 | 0.651 |
| 4.102920005588154 | 1.368 | 0.881 | 0.65 |
| 4.106061598241744 | 1.37 | 0.881 | 0.649 |
| 4.109203190895333 | 1.372 | 0.881 | 0.648 |
| 4.112344783548923 | 1.374 | 0.88 | 0.647 |
| 4.115486376202512 | 1.377 | 0.88 | 0.646 |
| 4.118627968856102 | 1.379 | 0.879 | 0.645 |
| 4.121769561509692 | 1.381 | 0.879 | 0.644 |
| 4.124911154163281 | 1.383 | 0.878 | 0.643 |
| 4.128052746816871 | 1.386 | 0.878 | 0.642 |
| 4.13119433947046 | 1.388 | 0.877 | 0.641 |
| 4.13433593212405 | 1.39 | 0.877 | 0.641 |
| 4.13747752477764 | 1.392 | 0.877 | 0.64 |
| 4.14061911743123 | 1.394 | 0.876 | 0.639 |
| 4.143760710084818 | 1.397 | 0.876 | 0.638 |
| 4.146902302738408 | 1.399 | 0.875 | 0.637 |
| 4.150043895391998 | 1.401 | 0.875 | 0.636 |
| 4.153185488045588 | 1.403 | 0.874 | 0.635 |
| 4.156327080699177 | 1.406 | 0.874 | 0.634 |
| 4.159468673352766 | 1.408 | 0.873 | 0.633 |
| 4.162610266006356 | 1.41 | 0.873 | 0.632 |
| 4.165751858659946 | 1.412 | 0.873 | 0.631 |
| 4.168893451313535 | 1.414 | 0.872 | 0.63 |
| 4.172035043967125 | 1.417 | 0.872 | 0.63 |
| 4.175176636620715 | 1.419 | 0.871 | 0.629 |
| 4.178318229274304 | 1.421 | 0.871 | 0.628 |
| 4.181459821927894 | 1.423 | 0.871 | 0.627 |
| 4.184601414581484 | 1.426 | 0.87 | 0.626 |
| 4.187743007235073 | 1.428 | 0.87 | 0.625 |
| 4.190884599888663 | 1.43 | 0.869 | 0.624 |
| 4.194026192542252 | 1.432 | 0.869 | 0.624 |
| 4.197167785195842 | 1.434 | 0.868 | 0.623 |
| 4.200309377849432 | 1.437 | 0.868 | 0.622 |
| 4.203450970503021 | 1.439 | 0.868 | 0.621 |
| 4.206592563156611 | 1.441 | 0.867 | 0.62 |
| 4.2097341558102 | 1.443 | 0.867 | 0.619 |
| 4.21287574846379 | 1.446 | 0.866 | 0.619 |
| 4.21601734111738 | 1.448 | 0.866 | 0.618 |
| 4.21915893377097 | 1.45 | 0.866 | 0.617 |
| 4.222300526424559 | 1.452 | 0.865 | 0.616 |
| 4.225442119078148 | 1.454 | 0.865 | 0.615 |
| 4.228583711731738 | 1.457 | 0.865 | 0.615 |
| 4.231725304385327 | 1.459 | 0.864 | 0.614 |
| 4.234866897038917 | 1.461 | 0.864 | 0.613 |
| 4.238008489692506 | 1.463 | 0.863 | 0.612 |
| 4.241150082346096 | 1.465 | 0.863 | 0.612 |
| 4.244291674999685 | 1.468 | 0.863 | 0.611 |
| 4.247433267653276 | 1.47 | 0.862 | 0.61 |
| 4.250574860306865 | 1.472 | 0.862 | 0.609 |
| 4.253716452960455 | 1.474 | 0.861 | 0.609 |
| 4.256858045614044 | 1.476 | 0.861 | 0.608 |
| 4.259999638267634 | 1.478 | 0.861 | 0.607 |
| 4.263141230921224 | 1.481 | 0.86 | 0.606 |
| 4.266282823574813 | 1.483 | 0.86 | 0.606 |
| 4.269424416228403 | 1.485 | 0.86 | 0.605 |
| 4.272566008881992 | 1.487 | 0.859 | 0.604 |
| 4.275707601535582 | 1.489 | 0.859 | 0.604 |
| 4.27884919418917 | 1.491 | 0.859 | 0.603 |
| 4.28199078684276 | 1.493 | 0.858 | 0.602 |
| 4.285132379496351 | 1.495 | 0.858 | 0.601 |
| 4.28827397214994 | 1.498 | 0.858 | 0.601 |
| 4.29141556480353 | 1.5 | 0.857 | 0.6 |
| 4.294557157457119 | 1.502 | 0.857 | 0.599 |
| 4.29769875011071 | 1.504 | 0.857 | 0.599 |
| 4.300840342764299 | 1.506 | 0.856 | 0.598 |
| 4.303981935417888 | 1.508 | 0.856 | 0.597 |
| 4.307123528071478 | 1.51 | 0.855 | 0.597 |
| 4.310265120725067 | 1.512 | 0.855 | 0.596 |
| 4.313406713378657 | 1.514 | 0.855 | 0.595 |
| 4.316548306032247 | 1.516 | 0.855 | 0.595 |
| 4.319689898685836 | 1.518 | 0.854 | 0.594 |
| 4.322831491339426 | 1.52 | 0.854 | 0.594 |
| 4.325973083993015 | 1.523 | 0.854 | 0.593 |
| 4.329114676646605 | 1.525 | 0.853 | 0.592 |
| 4.332256269300195 | 1.527 | 0.853 | 0.592 |
| 4.335397861953784 | 1.529 | 0.853 | 0.591 |
| 4.338539454607374 | 1.531 | 0.852 | 0.591 |
| 4.341681047260963 | 1.533 | 0.852 | 0.59 |
| 4.344822639914553 | 1.535 | 0.852 | 0.589 |
| 4.347964232568143 | 1.537 | 0.851 | 0.589 |
| 4.351105825221732 | 1.539 | 0.851 | 0.588 |
| 4.354247417875322 | 1.54 | 0.851 | 0.588 |
| 4.357389010528911 | 1.542 | 0.85 | 0.587 |
| 4.360530603182501 | 1.544 | 0.85 | 0.587 |
| 4.36367219583609 | 1.546 | 0.85 | 0.586 |
| 4.36681378848968 | 1.548 | 0.85 | 0.585 |
| 4.36995538114327 | 1.55 | 0.849 | 0.585 |
| 4.373096973796859 | 1.552 | 0.849 | 0.584 |
| 4.376238566450449 | 1.554 | 0.849 | 0.584 |
| 4.379380159104038 | 1.556 | 0.848 | 0.583 |
| 4.382521751757628 | 1.558 | 0.848 | 0.583 |
| 4.385663344411217 | 1.56 | 0.848 | 0.582 |
| 4.388804937064807 | 1.561 | 0.848 | 0.582 |
| 4.391946529718397 | 1.563 | 0.847 | 0.581 |
| 4.395088122371987 | 1.565 | 0.847 | 0.581 |
| 4.398229715025576 | 1.567 | 0.847 | 0.58 |
| 4.401371307679165 | 1.569 | 0.847 | 0.58 |
| 4.404512900332755 | 1.571 | 0.846 | 0.579 |
| 4.407654492986345 | 1.572 | 0.846 | 0.579 |
| 4.410796085639934 | 1.574 | 0.846 | 0.578 |
| 4.413937678293524 | 1.576 | 0.846 | 0.578 |
| 4.417079270947114 | 1.578 | 0.845 | 0.577 |
| 4.420220863600703 | 1.579 | 0.845 | 0.577 |
| 4.423362456254293 | 1.581 | 0.845 | 0.576 |
| 4.426504048907883 | 1.583 | 0.845 | 0.576 |
| 4.429645641561472 | 1.584 | 0.844 | 0.575 |
| 4.432787234215062 | 1.586 | 0.844 | 0.575 |
| 4.435928826868651 | 1.588 | 0.844 | 0.575 |
| 4.43907041952224 | 1.589 | 0.844 | 0.574 |
| 4.44221201217583 | 1.591 | 0.843 | 0.574 |
| 4.44535360482942 | 1.593 | 0.843 | 0.573 |
| 4.44849519748301 | 1.594 | 0.843 | 0.573 |
| 4.4516367901366 | 1.596 | 0.843 | 0.572 |
| 4.454778382790188 | 1.598 | 0.842 | 0.572 |
| 4.457919975443779 | 1.599 | 0.842 | 0.572 |
| 4.461061568097368 | 1.601 | 0.842 | 0.571 |
| 4.464203160750958 | 1.602 | 0.842 | 0.571 |
| 4.467344753404547 | 1.604 | 0.842 | 0.57 |
| 4.470486346058137 | 1.605 | 0.841 | 0.57 |
| 4.473627938711726 | 1.607 | 0.841 | 0.57 |
| 4.476769531365316 | 1.608 | 0.841 | 0.569 |
| 4.479911124018905 | 1.61 | 0.841 | 0.569 |
| 4.483052716672495 | 1.611 | 0.841 | 0.569 |
| 4.486194309326085 | 1.613 | 0.84 | 0.568 |
| 4.489335901979674 | 1.614 | 0.84 | 0.568 |
| 4.492477494633264 | 1.615 | 0.84 | 0.568 |
| 4.495619087286854 | 1.617 | 0.84 | 0.567 |
| 4.498760679940443 | 1.618 | 0.84 | 0.567 |
| 4.501902272594033 | 1.62 | 0.839 | 0.567 |
| 4.505043865247622 | 1.621 | 0.839 | 0.566 |
| 4.508185457901212 | 1.622 | 0.839 | 0.566 |
| 4.511327050554801 | 1.623 | 0.839 | 0.566 |
| 4.514468643208391 | 1.625 | 0.839 | 0.565 |
| 4.517610235861981 | 1.626 | 0.839 | 0.565 |
| 4.520751828515571 | 1.627 | 0.838 | 0.565 |
| 4.52389342116916 | 1.629 | 0.838 | 0.564 |
| 4.52703501382275 | 1.63 | 0.838 | 0.564 |
| 4.530176606476339 | 1.631 | 0.838 | 0.564 |
| 4.533318199129928 | 1.632 | 0.838 | 0.564 |
| 4.536459791783518 | 1.633 | 0.838 | 0.563 |
| 4.539601384437108 | 1.634 | 0.837 | 0.563 |
| 4.542742977090698 | 1.636 | 0.837 | 0.563 |
| 4.545884569744287 | 1.637 | 0.837 | 0.562 |
| 4.549026162397876 | 1.638 | 0.837 | 0.562 |
| 4.552167755051466 | 1.639 | 0.837 | 0.562 |
| 4.555309347705056 | 1.64 | 0.837 | 0.562 |
| 4.558450940358646 | 1.641 | 0.837 | 0.561 |
| 4.561592533012235 | 1.642 | 0.836 | 0.561 |
| 4.564734125665825 | 1.643 | 0.836 | 0.561 |
| 4.567875718319415 | 1.644 | 0.836 | 0.561 |
| 4.571017310973004 | 1.645 | 0.836 | 0.561 |
| 4.574158903626594 | 1.646 | 0.836 | 0.56 |
| 4.577300496280183 | 1.647 | 0.836 | 0.56 |
| 4.580442088933772 | 1.648 | 0.836 | 0.56 |
| 4.583583681587362 | 1.649 | 0.836 | 0.56 |
| 4.586725274240952 | 1.649 | 0.836 | 0.559 |
| 4.589866866894542 | 1.65 | 0.835 | 0.559 |
| 4.593008459548131 | 1.651 | 0.835 | 0.559 |
| 4.596150052201721 | 1.652 | 0.835 | 0.559 |
| 4.59929164485531 | 1.653 | 0.835 | 0.559 |
| 4.6024332375089 | 1.653 | 0.835 | 0.559 |
| 4.60557483016249 | 1.654 | 0.835 | 0.558 |
| 4.608716422816079 | 1.655 | 0.835 | 0.558 |
| 4.611858015469668 | 1.656 | 0.835 | 0.558 |
| 4.614999608123258 | 1.656 | 0.835 | 0.558 |
| 4.618141200776848 | 1.657 | 0.835 | 0.558 |
| 4.621282793430437 | 1.658 | 0.834 | 0.558 |
| 4.624424386084027 | 1.658 | 0.834 | 0.557 |
| 4.627565978737617 | 1.659 | 0.834 | 0.557 |
| 4.630707571391206 | 1.659 | 0.834 | 0.557 |
| 4.633849164044795 | 1.66 | 0.834 | 0.557 |
| 4.636990756698386 | 1.66 | 0.834 | 0.557 |
| 4.640132349351975 | 1.661 | 0.834 | 0.557 |
| 4.643273942005564 | 1.661 | 0.834 | 0.557 |
| 4.646415534659154 | 1.662 | 0.834 | 0.557 |
| 4.649557127312744 | 1.662 | 0.834 | 0.557 |
| 4.652698719966334 | 1.663 | 0.834 | 0.556 |
| 4.655840312619923 | 1.663 | 0.834 | 0.556 |
| 4.658981905273513 | 1.664 | 0.834 | 0.556 |
| 4.662123497927102 | 1.664 | 0.834 | 0.556 |
| 4.665265090580692 | 1.664 | 0.834 | 0.556 |
| 4.668406683234282 | 1.665 | 0.834 | 0.556 |
| 4.671548275887871 | 1.665 | 0.834 | 0.556 |
| 4.674689868541461 | 1.665 | 0.834 | 0.556 |
| 4.67783146119505 | 1.665 | 0.833 | 0.556 |
| 4.68097305384864 | 1.666 | 0.833 | 0.556 |
| 4.68411464650223 | 1.666 | 0.833 | 0.556 |
| 4.687256239155819 | 1.666 | 0.833 | 0.556 |
| 4.690397831809409 | 1.666 | 0.833 | 0.556 |
| 4.693539424462998 | 1.666 | 0.833 | 0.556 |
| 4.696681017116588 | 1.666 | 0.833 | 0.556 |
| 4.699822609770177 | 1.666 | 0.833 | 0.556 |
| 4.702964202423767 | 1.667 | 0.833 | 0.556 |
| 4.706105795077356 | 1.667 | 0.833 | 0.556 |
| 4.709247387730946 | 1.667 | 0.833 | 0.556 |
| 4.712388980384535 | 1.667 | 0.833 | 0.556 |
| 4.715530573038126 | 1.667 | 0.833 | 0.556 |
| 4.718672165691715 | 1.667 | 0.833 | 0.556 |
| 4.721813758345305 | 1.667 | 0.833 | 0.556 |
| 4.724955350998894 | 1.666 | 0.833 | 0.556 |
| 4.728096943652484 | 1.666 | 0.833 | 0.556 |
| 4.731238536306074 | 1.666 | 0.833 | 0.556 |
| 4.734380128959663 | 1.666 | 0.833 | 0.556 |
| 4.737521721613253 | 1.666 | 0.833 | 0.556 |
| 4.740663314266842 | 1.666 | 0.833 | 0.556 |
| 4.743804906920432 | 1.666 | 0.833 | 0.556 |
| 4.74694649957402 | 1.665 | 0.833 | 0.556 |
| 4.750088092227611 | 1.665 | 0.834 | 0.556 |
| 4.7532296848812 | 1.665 | 0.834 | 0.556 |
| 4.75637127753479 | 1.665 | 0.834 | 0.556 |
| 4.75951287018838 | 1.664 | 0.834 | 0.556 |
| 4.76265446284197 | 1.664 | 0.834 | 0.556 |
| 4.765796055495559 | 1.664 | 0.834 | 0.556 |
| 4.768937648149149 | 1.663 | 0.834 | 0.556 |
| 4.772079240802738 | 1.663 | 0.834 | 0.556 |
| 4.775220833456327 | 1.662 | 0.834 | 0.557 |
| 4.778362426109917 | 1.662 | 0.834 | 0.557 |
| 4.781504018763507 | 1.661 | 0.834 | 0.557 |
| 4.784645611417097 | 1.661 | 0.834 | 0.557 |
| 4.787787204070686 | 1.66 | 0.834 | 0.557 |
| 4.790928796724275 | 1.66 | 0.834 | 0.557 |
| 4.794070389377865 | 1.659 | 0.834 | 0.557 |
| 4.797211982031455 | 1.659 | 0.834 | 0.557 |
| 4.800353574685045 | 1.658 | 0.834 | 0.557 |
| 4.803495167338634 | 1.658 | 0.834 | 0.558 |
| 4.806636759992224 | 1.657 | 0.835 | 0.558 |
| 4.809778352645814 | 1.656 | 0.835 | 0.558 |
| 4.812919945299403 | 1.656 | 0.835 | 0.558 |
| 4.816061537952993 | 1.655 | 0.835 | 0.558 |
| 4.819203130606582 | 1.654 | 0.835 | 0.558 |
| 4.822344723260172 | 1.653 | 0.835 | 0.559 |
| 4.825486315913761 | 1.653 | 0.835 | 0.559 |
| 4.828627908567351 | 1.652 | 0.835 | 0.559 |
| 4.83176950122094 | 1.651 | 0.835 | 0.559 |
| 4.83491109387453 | 1.65 | 0.835 | 0.559 |
| 4.83805268652812 | 1.649 | 0.836 | 0.559 |
| 4.841194279181709 | 1.649 | 0.836 | 0.56 |
| 4.844335871835299 | 1.648 | 0.836 | 0.56 |
| 4.847477464488889 | 1.647 | 0.836 | 0.56 |
| 4.850619057142478 | 1.646 | 0.836 | 0.56 |
| 4.853760649796068 | 1.645 | 0.836 | 0.561 |
| 4.856902242449657 | 1.644 | 0.836 | 0.561 |
| 4.860043835103247 | 1.643 | 0.836 | 0.561 |
| 4.863185427756837 | 1.642 | 0.836 | 0.561 |
| 4.866327020410426 | 1.641 | 0.837 | 0.561 |
| 4.869468613064015 | 1.64 | 0.837 | 0.562 |
| 4.872610205717605 | 1.639 | 0.837 | 0.562 |
| 4.875751798371195 | 1.638 | 0.837 | 0.562 |
| 4.878893391024784 | 1.637 | 0.837 | 0.562 |
| 4.882034983678374 | 1.636 | 0.837 | 0.563 |
| 4.885176576331964 | 1.634 | 0.837 | 0.563 |
| 4.888318168985553 | 1.633 | 0.838 | 0.563 |
| 4.891459761639143 | 1.632 | 0.838 | 0.564 |
| 4.894601354292733 | 1.631 | 0.838 | 0.564 |
| 4.897742946946322 | 1.63 | 0.838 | 0.564 |
| 4.900884539599912 | 1.629 | 0.838 | 0.564 |
| 4.904026132253501 | 1.627 | 0.838 | 0.565 |
| 4.907167724907091 | 1.626 | 0.839 | 0.565 |
| 4.91030931756068 | 1.625 | 0.839 | 0.565 |
| 4.91345091021427 | 1.623 | 0.839 | 0.566 |
| 4.91659250286786 | 1.622 | 0.839 | 0.566 |
| 4.91973409552145 | 1.621 | 0.839 | 0.566 |
| 4.922875688175039 | 1.62 | 0.839 | 0.567 |
| 4.926017280828628 | 1.618 | 0.84 | 0.567 |
| 4.929158873482218 | 1.617 | 0.84 | 0.567 |
| 4.932300466135808 | 1.615 | 0.84 | 0.568 |
| 4.935442058789397 | 1.614 | 0.84 | 0.568 |
| 4.938583651442987 | 1.613 | 0.84 | 0.568 |
| 4.941725244096576 | 1.611 | 0.841 | 0.569 |
| 4.944866836750166 | 1.61 | 0.841 | 0.569 |
| 4.948008429403755 | 1.608 | 0.841 | 0.569 |
| 4.951150022057345 | 1.607 | 0.841 | 0.57 |
| 4.954291614710935 | 1.605 | 0.841 | 0.57 |
| 4.957433207364524 | 1.604 | 0.842 | 0.57 |
| 4.960574800018114 | 1.602 | 0.842 | 0.571 |
| 4.963716392671704 | 1.601 | 0.842 | 0.571 |
| 4.966857985325293 | 1.599 | 0.842 | 0.572 |
| 4.969999577978883 | 1.598 | 0.842 | 0.572 |
| 4.973141170632472 | 1.596 | 0.843 | 0.572 |
| 4.976282763286062 | 1.594 | 0.843 | 0.573 |
| 4.979424355939651 | 1.593 | 0.843 | 0.573 |
| 4.982565948593241 | 1.591 | 0.843 | 0.574 |
| 4.985707541246831 | 1.589 | 0.844 | 0.574 |
| 4.98884913390042 | 1.588 | 0.844 | 0.575 |
| 4.99199072655401 | 1.586 | 0.844 | 0.575 |
| 4.9951323192076 | 1.584 | 0.844 | 0.575 |
| 4.99827391186119 | 1.583 | 0.845 | 0.576 |
| 5.00141550451478 | 1.581 | 0.845 | 0.576 |
| 5.004557097168369 | 1.579 | 0.845 | 0.577 |
| 5.007698689821958 | 1.578 | 0.845 | 0.577 |
| 5.010840282475548 | 1.576 | 0.846 | 0.578 |
| 5.013981875129137 | 1.574 | 0.846 | 0.578 |
| 5.017123467782727 | 1.572 | 0.846 | 0.579 |
| 5.020265060436317 | 1.571 | 0.846 | 0.579 |
| 5.023406653089906 | 1.569 | 0.847 | 0.58 |
| 5.026548245743496 | 1.567 | 0.847 | 0.58 |
| 5.029689838397085 | 1.565 | 0.847 | 0.581 |
| 5.032831431050674 | 1.563 | 0.847 | 0.581 |
| 5.035973023704264 | 1.561 | 0.848 | 0.582 |
| 5.039114616357854 | 1.56 | 0.848 | 0.582 |
| 5.042256209011444 | 1.558 | 0.848 | 0.583 |
| 5.045397801665033 | 1.556 | 0.848 | 0.583 |
| 5.048539394318622 | 1.554 | 0.849 | 0.584 |
| 5.051680986972213 | 1.552 | 0.849 | 0.584 |
| 5.054822579625802 | 1.55 | 0.849 | 0.585 |
| 5.057964172279392 | 1.548 | 0.85 | 0.585 |
| 5.061105764932981 | 1.546 | 0.85 | 0.586 |
| 5.064247357586571 | 1.544 | 0.85 | 0.587 |
| 5.067388950240161 | 1.542 | 0.85 | 0.587 |
| 5.07053054289375 | 1.54 | 0.851 | 0.588 |
| 5.07367213554734 | 1.539 | 0.851 | 0.588 |
| 5.07681372820093 | 1.537 | 0.851 | 0.589 |
| 5.079955320854519 | 1.535 | 0.852 | 0.589 |
| 5.083096913508108 | 1.533 | 0.852 | 0.59 |
| 5.086238506161698 | 1.531 | 0.852 | 0.591 |
| 5.089380098815288 | 1.529 | 0.853 | 0.591 |
| 5.092521691468877 | 1.527 | 0.853 | 0.592 |
| 5.095663284122466 | 1.525 | 0.853 | 0.592 |
| 5.098804876776057 | 1.523 | 0.854 | 0.593 |
| 5.101946469429646 | 1.52 | 0.854 | 0.594 |
| 5.105088062083236 | 1.518 | 0.854 | 0.594 |
| 5.108229654736825 | 1.516 | 0.855 | 0.595 |
| 5.111371247390415 | 1.514 | 0.855 | 0.595 |
| 5.114512840044005 | 1.512 | 0.855 | 0.596 |
| 5.117654432697594 | 1.51 | 0.855 | 0.597 |
| 5.120796025351184 | 1.508 | 0.856 | 0.597 |
| 5.123937618004773 | 1.506 | 0.856 | 0.598 |
| 5.127079210658363 | 1.504 | 0.857 | 0.599 |
| 5.130220803311953 | 1.502 | 0.857 | 0.599 |
| 5.133362395965542 | 1.5 | 0.857 | 0.6 |
| 5.136503988619131 | 1.498 | 0.858 | 0.601 |
| 5.13964558127272 | 1.495 | 0.858 | 0.601 |
| 5.142787173926311 | 1.493 | 0.858 | 0.602 |
| 5.1459287665799 | 1.491 | 0.859 | 0.603 |
| 5.14907035923349 | 1.489 | 0.859 | 0.604 |
| 5.15221195188708 | 1.487 | 0.859 | 0.604 |
| 5.15535354454067 | 1.485 | 0.86 | 0.605 |
| 5.158495137194259 | 1.483 | 0.86 | 0.606 |
| 5.161636729847848 | 1.481 | 0.86 | 0.606 |
| 5.164778322501438 | 1.478 | 0.861 | 0.607 |
| 5.167919915155028 | 1.476 | 0.861 | 0.608 |
| 5.171061507808617 | 1.474 | 0.861 | 0.609 |
| 5.174203100462206 | 1.472 | 0.862 | 0.609 |
| 5.177344693115796 | 1.47 | 0.862 | 0.61 |
| 5.180486285769386 | 1.468 | 0.863 | 0.611 |
| 5.183627878422976 | 1.465 | 0.863 | 0.612 |
| 5.186769471076565 | 1.463 | 0.863 | 0.612 |
| 5.189911063730155 | 1.461 | 0.864 | 0.613 |
| 5.193052656383744 | 1.459 | 0.864 | 0.614 |
| 5.196194249037334 | 1.457 | 0.865 | 0.615 |
| 5.199335841690924 | 1.454 | 0.865 | 0.615 |
| 5.202477434344513 | 1.452 | 0.865 | 0.616 |
| 5.205619026998103 | 1.45 | 0.866 | 0.617 |
| 5.208760619651692 | 1.448 | 0.866 | 0.618 |
| 5.211902212305282 | 1.446 | 0.866 | 0.619 |
| 5.215043804958871 | 1.443 | 0.867 | 0.619 |
| 5.218185397612461 | 1.441 | 0.867 | 0.62 |
| 5.221326990266051 | 1.439 | 0.868 | 0.621 |
| 5.22446858291964 | 1.437 | 0.868 | 0.622 |
| 5.22761017557323 | 1.434 | 0.868 | 0.623 |
| 5.23075176822682 | 1.432 | 0.869 | 0.624 |
| 5.23389336088041 | 1.43 | 0.869 | 0.624 |
| 5.237034953533999 | 1.428 | 0.87 | 0.625 |
| 5.240176546187588 | 1.426 | 0.87 | 0.626 |
| 5.243318138841178 | 1.423 | 0.871 | 0.627 |
| 5.246459731494767 | 1.421 | 0.871 | 0.628 |
| 5.249601324148357 | 1.419 | 0.871 | 0.629 |
| 5.252742916801947 | 1.417 | 0.872 | 0.63 |
| 5.255884509455536 | 1.414 | 0.872 | 0.63 |
| 5.259026102109125 | 1.412 | 0.873 | 0.631 |
| 5.262167694762715 | 1.41 | 0.873 | 0.632 |
| 5.265309287416305 | 1.408 | 0.873 | 0.633 |
| 5.268450880069895 | 1.406 | 0.874 | 0.634 |
| 5.271592472723484 | 1.403 | 0.874 | 0.635 |
| 5.274734065377074 | 1.401 | 0.875 | 0.636 |
| 5.277875658030664 | 1.399 | 0.875 | 0.637 |
| 5.281017250684253 | 1.397 | 0.876 | 0.638 |
| 5.284158843337843 | 1.394 | 0.876 | 0.639 |
| 5.287300435991432 | 1.392 | 0.877 | 0.64 |
| 5.290442028645022 | 1.39 | 0.877 | 0.641 |
| 5.293583621298612 | 1.388 | 0.877 | 0.641 |
| 5.296725213952201 | 1.386 | 0.878 | 0.642 |
| 5.299866806605791 | 1.383 | 0.878 | 0.643 |
| 5.30300839925938 | 1.381 | 0.879 | 0.644 |
| 5.30614999191297 | 1.379 | 0.879 | 0.645 |
| 5.30929158456656 | 1.377 | 0.88 | 0.646 |
| 5.312433177220149 | 1.374 | 0.88 | 0.647 |
| 5.315574769873739 | 1.372 | 0.881 | 0.648 |
| 5.318716362527328 | 1.37 | 0.881 | 0.649 |
| 5.321857955180918 | 1.368 | 0.881 | 0.65 |
| 5.324999547834508 | 1.366 | 0.882 | 0.651 |
| 5.328141140488097 | 1.363 | 0.882 | 0.652 |
| 5.331282733141686 | 1.361 | 0.883 | 0.653 |
| 5.334424325795276 | 1.359 | 0.883 | 0.654 |
| 5.337565918448866 | 1.357 | 0.884 | 0.655 |
| 5.340707511102456 | 1.355 | 0.884 | 0.656 |
| 5.343849103756045 | 1.352 | 0.885 | 0.657 |
| 5.346990696409634 | 1.35 | 0.885 | 0.658 |
| 5.350132289063224 | 1.348 | 0.886 | 0.659 |
| 5.353273881716814 | 1.346 | 0.886 | 0.66 |
| 5.356415474370403 | 1.344 | 0.887 | 0.662 |
| 5.359557067023993 | 1.342 | 0.887 | 0.663 |
| 5.362698659677583 | 1.339 | 0.888 | 0.664 |
| 5.365840252331172 | 1.337 | 0.888 | 0.665 |
| 5.368981844984762 | 1.335 | 0.889 | 0.666 |
| 5.372123437638351 | 1.333 | 0.889 | 0.667 |
| 5.375265030291941 | 1.331 | 0.889 | 0.668 |
| 5.378406622945531 | 1.329 | 0.89 | 0.669 |
| 5.38154821559912 | 1.326 | 0.89 | 0.67 |
| 5.38468980825271 | 1.324 | 0.891 | 0.671 |
| 5.387831400906299 | 1.322 | 0.891 | 0.672 |
| 5.39097299355989 | 1.32 | 0.892 | 0.673 |
| 5.394114586213479 | 1.318 | 0.892 | 0.675 |
| 5.397256178867068 | 1.316 | 0.893 | 0.676 |
| 5.400397771520657 | 1.314 | 0.893 | 0.677 |
| 5.403539364174247 | 1.311 | 0.894 | 0.678 |
| 5.406680956827837 | 1.309 | 0.894 | 0.679 |
| 5.409822549481426 | 1.307 | 0.895 | 0.68 |
| 5.412964142135016 | 1.305 | 0.895 | 0.681 |
| 5.416105734788605 | 1.303 | 0.896 | 0.683 |
| 5.419247327442195 | 1.301 | 0.896 | 0.684 |
| 5.422388920095785 | 1.299 | 0.897 | 0.685 |
| 5.425530512749375 | 1.297 | 0.897 | 0.686 |
| 5.428672105402964 | 1.295 | 0.898 | 0.687 |
| 5.431813698056554 | 1.293 | 0.898 | 0.688 |
| 5.434955290710143 | 1.29 | 0.899 | 0.69 |
| 5.438096883363733 | 1.288 | 0.899 | 0.691 |
| 5.441238476017322 | 1.286 | 0.9 | 0.692 |
| 5.444380068670912 | 1.284 | 0.9 | 0.693 |
| 5.447521661324502 | 1.282 | 0.901 | 0.694 |
| 5.450663253978091 | 1.28 | 0.901 | 0.696 |
| 5.453804846631681 | 1.278 | 0.902 | 0.697 |
| 5.456946439285271 | 1.276 | 0.902 | 0.698 |
| 5.46008803193886 | 1.274 | 0.903 | 0.699 |
| 5.46322962459245 | 1.272 | 0.903 | 0.7 |
| 5.466371217246039 | 1.27 | 0.904 | 0.702 |
| 5.46951280989963 | 1.268 | 0.904 | 0.703 |
| 5.472654402553218 | 1.266 | 0.905 | 0.704 |
| 5.475795995206808 | 1.264 | 0.905 | 0.705 |
| 5.478937587860398 | 1.262 | 0.906 | 0.707 |
| 5.482079180513987 | 1.26 | 0.907 | 0.708 |
| 5.485220773167577 | 1.258 | 0.907 | 0.709 |
| 5.488362365821166 | 1.256 | 0.908 | 0.71 |
| 5.491503958474756 | 1.254 | 0.908 | 0.712 |
| 5.494645551128346 | 1.252 | 0.909 | 0.713 |
| 5.497787143781935 | 1.25 | 0.909 | 0.714 |
| 5.500928736435525 | 1.248 | 0.91 | 0.716 |
| 5.504070329089115 | 1.246 | 0.91 | 0.717 |
| 5.507211921742704 | 1.244 | 0.911 | 0.718 |
| 5.510353514396294 | 1.242 | 0.911 | 0.719 |
| 5.513495107049883 | 1.24 | 0.912 | 0.721 |
| 5.516636699703473 | 1.238 | 0.912 | 0.722 |
| 5.519778292357062 | 1.236 | 0.913 | 0.723 |
| 5.522919885010652 | 1.234 | 0.913 | 0.725 |
| 5.526061477664242 | 1.233 | 0.914 | 0.726 |
| 5.529203070317831 | 1.231 | 0.914 | 0.727 |
| 5.532344662971421 | 1.229 | 0.915 | 0.729 |
| 5.535486255625011 | 1.227 | 0.915 | 0.73 |
| 5.5386278482786 | 1.225 | 0.916 | 0.731 |
| 5.54176944093219 | 1.223 | 0.916 | 0.733 |
| 5.544911033585779 | 1.221 | 0.917 | 0.734 |
| 5.54805262623937 | 1.219 | 0.917 | 0.735 |
| 5.551194218892959 | 1.218 | 0.918 | 0.737 |
| 5.554335811546548 | 1.216 | 0.919 | 0.738 |
| 5.557477404200137 | 1.214 | 0.919 | 0.739 |
| 5.560618996853727 | 1.212 | 0.92 | 0.741 |
| 5.563760589507317 | 1.21 | 0.92 | 0.742 |
| 5.566902182160906 | 1.208 | 0.921 | 0.744 |
| 5.570043774814496 | 1.207 | 0.921 | 0.745 |
| 5.573185367468086 | 1.205 | 0.922 | 0.746 |
| 5.576326960121675 | 1.203 | 0.922 | 0.748 |
| 5.579468552775264 | 1.201 | 0.923 | 0.749 |
| 5.582610145428854 | 1.199 | 0.923 | 0.75 |
| 5.585751738082444 | 1.198 | 0.924 | 0.752 |
| 5.588893330736034 | 1.196 | 0.924 | 0.753 |
| 5.592034923389623 | 1.194 | 0.925 | 0.755 |
| 5.595176516043213 | 1.192 | 0.925 | 0.756 |
| 5.598318108696803 | 1.191 | 0.926 | 0.758 |
| 5.601459701350392 | 1.189 | 0.926 | 0.759 |
| 5.604601294003982 | 1.187 | 0.927 | 0.76 |
| 5.607742886657571 | 1.185 | 0.927 | 0.762 |
| 5.610884479311161 | 1.184 | 0.928 | 0.763 |
| 5.61402607196475 | 1.182 | 0.929 | 0.765 |
| 5.61716766461834 | 1.18 | 0.929 | 0.766 |
| 5.62030925727193 | 1.179 | 0.93 | 0.767 |
| 5.623450849925519 | 1.177 | 0.93 | 0.769 |
| 5.626592442579109 | 1.175 | 0.931 | 0.77 |
| 5.629734035232698 | 1.173 | 0.931 | 0.772 |
| 5.632875627886288 | 1.172 | 0.932 | 0.773 |
| 5.636017220539878 | 1.17 | 0.932 | 0.775 |
| 5.639158813193467 | 1.168 | 0.933 | 0.776 |
| 5.642300405847057 | 1.167 | 0.933 | 0.778 |
| 5.645441998500646 | 1.165 | 0.934 | 0.779 |
| 5.648583591154236 | 1.164 | 0.934 | 0.781 |
| 5.651725183807825 | 1.162 | 0.935 | 0.782 |
| 5.654866776461415 | 1.16 | 0.935 | 0.783 |
| 5.658008369115005 | 1.159 | 0.936 | 0.785 |
| 5.661149961768594 | 1.157 | 0.936 | 0.786 |
| 5.664291554422184 | 1.156 | 0.937 | 0.788 |
| 5.667433147075774 | 1.154 | 0.937 | 0.789 |
| 5.670574739729363 | 1.152 | 0.938 | 0.791 |
| 5.673716332382953 | 1.151 | 0.938 | 0.792 |
| 5.676857925036542 | 1.149 | 0.939 | 0.794 |
| 5.679999517690132 | 1.148 | 0.94 | 0.795 |
| 5.683141110343721 | 1.146 | 0.94 | 0.797 |
| 5.686282702997311 | 1.145 | 0.941 | 0.798 |
| 5.689424295650901 | 1.143 | 0.941 | 0.8 |
| 5.69256588830449 | 1.142 | 0.942 | 0.801 |
| 5.69570748095808 | 1.14 | 0.942 | 0.803 |
| 5.69884907361167 | 1.139 | 0.943 | 0.804 |
| 5.701990666265259 | 1.137 | 0.943 | 0.806 |
| 5.705132258918849 | 1.136 | 0.944 | 0.807 |
| 5.708273851572438 | 1.134 | 0.944 | 0.809 |
| 5.711415444226028 | 1.133 | 0.945 | 0.81 |
| 5.714557036879618 | 1.131 | 0.945 | 0.812 |
| 5.717698629533207 | 1.13 | 0.946 | 0.813 |
| 5.720840222186797 | 1.128 | 0.946 | 0.815 |
| 5.723981814840386 | 1.127 | 0.947 | 0.816 |
| 5.727123407493976 | 1.125 | 0.947 | 0.818 |
| 5.730265000147565 | 1.124 | 0.948 | 0.819 |
| 5.733406592801155 | 1.123 | 0.948 | 0.821 |
| 5.736548185454744 | 1.121 | 0.949 | 0.822 |
| 5.739689778108334 | 1.12 | 0.949 | 0.824 |
| 5.742831370761924 | 1.118 | 0.95 | 0.825 |
| 5.745972963415514 | 1.117 | 0.95 | 0.827 |
| 5.749114556069103 | 1.116 | 0.951 | 0.828 |
| 5.752256148722693 | 1.114 | 0.951 | 0.83 |
| 5.755397741376282 | 1.113 | 0.952 | 0.831 |
| 5.758539334029872 | 1.112 | 0.952 | 0.833 |
| 5.761680926683462 | 1.11 | 0.953 | 0.834 |
| 5.764822519337051 | 1.109 | 0.953 | 0.836 |
| 5.767964111990641 | 1.108 | 0.954 | 0.837 |
| 5.77110570464423 | 1.106 | 0.954 | 0.839 |
| 5.77424729729782 | 1.105 | 0.955 | 0.84 |
| 5.77738888995141 | 1.104 | 0.955 | 0.842 |
| 5.780530482605 | 1.102 | 0.956 | 0.843 |
| 5.783672075258588 | 1.101 | 0.956 | 0.845 |
| 5.786813667912178 | 1.1 | 0.957 | 0.846 |
| 5.789955260565768 | 1.099 | 0.957 | 0.848 |
| 5.793096853219358 | 1.097 | 0.958 | 0.849 |
| 5.796238445872947 | 1.096 | 0.958 | 0.851 |
| 5.799380038526537 | 1.095 | 0.959 | 0.852 |
| 5.802521631180126 | 1.094 | 0.959 | 0.854 |
| 5.805663223833715 | 1.092 | 0.959 | 0.855 |
| 5.808804816487306 | 1.091 | 0.96 | 0.857 |
| 5.811946409140895 | 1.09 | 0.96 | 0.858 |
| 5.815088001794485 | 1.089 | 0.961 | 0.86 |
| 5.818229594448074 | 1.087 | 0.961 | 0.861 |
| 5.821371187101663 | 1.086 | 0.962 | 0.863 |
| 5.824512779755254 | 1.085 | 0.962 | 0.864 |
| 5.827654372408843 | 1.084 | 0.963 | 0.866 |
| 5.830795965062433 | 1.083 | 0.963 | 0.867 |
| 5.833937557716022 | 1.082 | 0.964 | 0.869 |
| 5.837079150369612 | 1.08 | 0.964 | 0.87 |
| 5.840220743023201 | 1.079 | 0.965 | 0.872 |
| 5.843362335676791 | 1.078 | 0.965 | 0.873 |
| 5.846503928330381 | 1.077 | 0.965 | 0.875 |
| 5.84964552098397 | 1.076 | 0.966 | 0.876 |
| 5.85278711363756 | 1.075 | 0.966 | 0.878 |
| 5.85592870629115 | 1.074 | 0.967 | 0.879 |
| 5.85907029894474 | 1.073 | 0.967 | 0.881 |
| 5.862211891598329 | 1.072 | 0.968 | 0.882 |
| 5.865353484251918 | 1.071 | 0.968 | 0.884 |
| 5.868495076905508 | 1.069 | 0.969 | 0.885 |
| 5.871636669559098 | 1.068 | 0.969 | 0.887 |
| 5.874778262212687 | 1.067 | 0.969 | 0.888 |
| 5.877919854866277 | 1.066 | 0.97 | 0.889 |
| 5.881061447519866 | 1.065 | 0.97 | 0.891 |
| 5.884203040173456 | 1.064 | 0.971 | 0.892 |
| 5.887344632827046 | 1.063 | 0.971 | 0.894 |
| 5.890486225480635 | 1.062 | 0.972 | 0.895 |
| 5.893627818134224 | 1.061 | 0.972 | 0.897 |
| 5.896769410787814 | 1.06 | 0.972 | 0.898 |
| 5.899911003441404 | 1.059 | 0.973 | 0.899 |
| 5.903052596094994 | 1.058 | 0.973 | 0.901 |
| 5.906194188748583 | 1.057 | 0.974 | 0.902 |
| 5.909335781402172 | 1.056 | 0.974 | 0.904 |
| 5.912477374055762 | 1.055 | 0.974 | 0.905 |
| 5.915618966709352 | 1.054 | 0.975 | 0.906 |
| 5.918760559362942 | 1.054 | 0.975 | 0.908 |
| 5.921902152016531 | 1.053 | 0.976 | 0.909 |
| 5.92504374467012 | 1.052 | 0.976 | 0.91 |
| 5.92818533732371 | 1.051 | 0.976 | 0.912 |
| 5.9313269299773 | 1.05 | 0.977 | 0.913 |
| 5.93446852263089 | 1.049 | 0.977 | 0.915 |
| 5.93761011528448 | 1.048 | 0.978 | 0.916 |
| 5.940751707938068 | 1.047 | 0.978 | 0.917 |
| 5.943893300591658 | 1.046 | 0.978 | 0.919 |
| 5.947034893245248 | 1.046 | 0.979 | 0.92 |
| 5.950176485898837 | 1.045 | 0.979 | 0.921 |
| 5.953318078552427 | 1.044 | 0.979 | 0.923 |
| 5.956459671206017 | 1.043 | 0.98 | 0.924 |
| 5.959601263859606 | 1.042 | 0.98 | 0.925 |
| 5.962742856513196 | 1.041 | 0.981 | 0.926 |
| 5.965884449166785 | 1.041 | 0.981 | 0.928 |
| 5.969026041820375 | 1.04 | 0.981 | 0.929 |
| 5.972167634473964 | 1.039 | 0.982 | 0.93 |
| 5.975309227127554 | 1.038 | 0.982 | 0.932 |
| 5.978450819781144 | 1.037 | 0.982 | 0.933 |
| 5.981592412434733 | 1.037 | 0.983 | 0.934 |
| 5.984734005088323 | 1.036 | 0.983 | 0.935 |
| 5.987875597741913 | 1.035 | 0.983 | 0.937 |
| 5.991017190395502 | 1.034 | 0.984 | 0.938 |
| 5.994158783049092 | 1.034 | 0.984 | 0.939 |
| 5.997300375702681 | 1.033 | 0.984 | 0.94 |
| 6.000441968356271 | 1.032 | 0.985 | 0.941 |
| 6.003583561009861 | 1.031 | 0.985 | 0.943 |
| 6.00672515366345 | 1.031 | 0.985 | 0.944 |
| 6.00986674631704 | 1.03 | 0.986 | 0.945 |
| 6.01300833897063 | 1.029 | 0.986 | 0.946 |
| 6.01614993162422 | 1.029 | 0.986 | 0.947 |
| 6.019291524277808 | 1.028 | 0.987 | 0.948 |
| 6.022433116931398 | 1.027 | 0.987 | 0.95 |
| 6.025574709584988 | 1.027 | 0.987 | 0.951 |
| 6.028716302238577 | 1.026 | 0.987 | 0.952 |
| 6.031857894892167 | 1.025 | 0.988 | 0.953 |
| 6.034999487545757 | 1.025 | 0.988 | 0.954 |
| 6.038141080199346 | 1.024 | 0.988 | 0.955 |
| 6.041282672852935 | 1.023 | 0.989 | 0.956 |
| 6.044424265506525 | 1.023 | 0.989 | 0.957 |
| 6.047565858160115 | 1.022 | 0.989 | 0.958 |
| 6.050707450813704 | 1.022 | 0.989 | 0.959 |
| 6.053849043467294 | 1.021 | 0.99 | 0.96 |
| 6.056990636120884 | 1.021 | 0.99 | 0.961 |
| 6.060132228774473 | 1.02 | 0.99 | 0.962 |
| 6.063273821428063 | 1.019 | 0.991 | 0.963 |
| 6.066415414081653 | 1.019 | 0.991 | 0.964 |
| 6.069557006735242 | 1.018 | 0.991 | 0.965 |
| 6.072698599388831 | 1.018 | 0.991 | 0.966 |
| 6.07584019204242 | 1.017 | 0.992 | 0.967 |
| 6.078981784696011 | 1.017 | 0.992 | 0.968 |
| 6.082123377349601 | 1.016 | 0.992 | 0.969 |
| 6.08526497000319 | 1.016 | 0.992 | 0.97 |
| 6.08840656265678 | 1.015 | 0.993 | 0.971 |
| 6.09154815531037 | 1.015 | 0.993 | 0.972 |
| 6.094689747963959 | 1.014 | 0.993 | 0.973 |
| 6.097831340617549 | 1.014 | 0.993 | 0.974 |
| 6.100972933271138 | 1.013 | 0.993 | 0.974 |
| 6.104114525924728 | 1.013 | 0.994 | 0.975 |
| 6.107256118578317 | 1.012 | 0.994 | 0.976 |
| 6.110397711231907 | 1.012 | 0.994 | 0.977 |
| 6.113539303885497 | 1.012 | 0.994 | 0.978 |
| 6.116680896539086 | 1.011 | 0.995 | 0.978 |
| 6.119822489192675 | 1.011 | 0.995 | 0.979 |
| 6.122964081846265 | 1.01 | 0.995 | 0.98 |
| 6.126105674499855 | 1.01 | 0.995 | 0.981 |
| 6.129247267153445 | 1.009 | 0.995 | 0.982 |
| 6.132388859807034 | 1.009 | 0.996 | 0.982 |
| 6.135530452460624 | 1.009 | 0.996 | 0.983 |
| 6.138672045114213 | 1.008 | 0.996 | 0.984 |
| 6.141813637767803 | 1.008 | 0.996 | 0.984 |
| 6.144955230421393 | 1.008 | 0.996 | 0.985 |
| 6.148096823074982 | 1.007 | 0.996 | 0.986 |
| 6.151238415728571 | 1.007 | 0.997 | 0.986 |
| 6.154380008382161 | 1.007 | 0.997 | 0.987 |
| 6.157521601035751 | 1.006 | 0.997 | 0.988 |
| 6.16066319368934 | 1.006 | 0.997 | 0.988 |
| 6.16380478634293 | 1.006 | 0.997 | 0.989 |
| 6.16694637899652 | 1.005 | 0.997 | 0.989 |
| 6.170087971650109 | 1.005 | 0.997 | 0.99 |
| 6.173229564303698 | 1.005 | 0.998 | 0.99 |
| 6.176371156957289 | 1.005 | 0.998 | 0.991 |
| 6.179512749610878 | 1.004 | 0.998 | 0.992 |
| 6.182654342264468 | 1.004 | 0.998 | 0.992 |
| 6.185795934918057 | 1.004 | 0.998 | 0.992 |
| 6.188937527571647 | 1.004 | 0.998 | 0.993 |
| 6.192079120225237 | 1.003 | 0.998 | 0.993 |
| 6.195220712878826 | 1.003 | 0.998 | 0.994 |
| 6.198362305532415 | 1.003 | 0.999 | 0.994 |
| 6.201503898186005 | 1.003 | 0.999 | 0.995 |
| 6.204645490839594 | 1.002 | 0.999 | 0.995 |
| 6.207787083493184 | 1.002 | 0.999 | 0.995 |
| 6.210928676146774 | 1.002 | 0.999 | 0.996 |
| 6.214070268800364 | 1.002 | 0.999 | 0.996 |
| 6.217211861453953 | 1.002 | 0.999 | 0.997 |
| 6.220353454107543 | 1.002 | 0.999 | 0.997 |
| 6.223495046761133 | 1.001 | 0.999 | 0.997 |
| 6.226636639414722 | 1.001 | 0.999 | 0.997 |
| 6.229778232068312 | 1.001 | 0.999 | 0.998 |
| 6.232919824721901 | 1.001 | 0.999 | 0.998 |
| 6.236061417375491 | 1.001 | 1 | 0.998 |
| 6.23920301002908 | 1.001 | 1 | 0.998 |
| 6.24234460268267 | 1.001 | 1 | 0.999 |
| 6.24548619533626 | 1.001 | 1 | 0.999 |
| 6.24862778798985 | 1 | 1 | 0.999 |
| 6.251769380643438 | 1 | 1 | 0.999 |
| 6.254910973297028 | 1 | 1 | 0.999 |
| 6.258052565950618 | 1 | 1 | 0.999 |
| 6.261194158604208 | 1 | 1 | 1 |
| 6.264335751257797 | 1 | 1 | 1 |
| 6.267477343911387 | 1 | 1 | 1 |
| 6.270618936564976 | 1 | 1 | 1 |
| 6.273760529218566 | 1 | 1 | 1 |
| 6.276902121872155 | 1 | 1 | 1 |
| 6.280043714525745 | 1 | 1 | 1 |
| 6.283185307179335 | 1 | 1 | 1 |